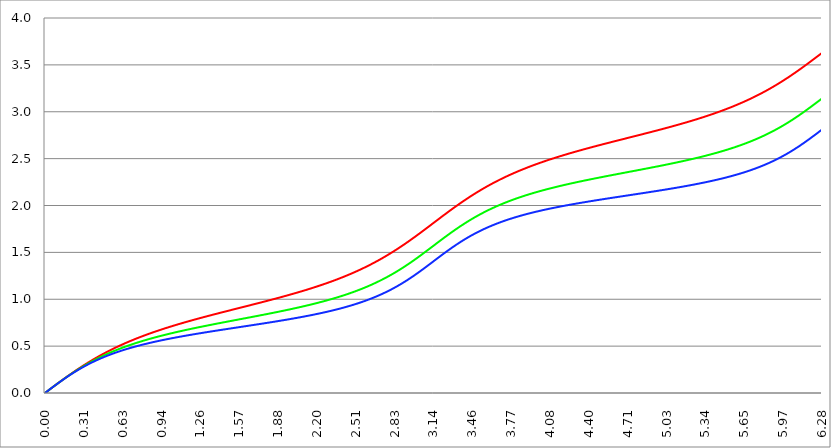
| Category | Series 1 | Series 0 | Series 2 |
|---|---|---|---|
| 0.0 | 0 | 0 | 0 |
| 0.00314159265358979 | 0.003 | 0.003 | 0.003 |
| 0.00628318530717958 | 0.006 | 0.006 | 0.006 |
| 0.00942477796076938 | 0.009 | 0.009 | 0.009 |
| 0.0125663706143592 | 0.013 | 0.013 | 0.013 |
| 0.015707963267949 | 0.016 | 0.016 | 0.016 |
| 0.0188495559215388 | 0.019 | 0.019 | 0.019 |
| 0.0219911485751285 | 0.022 | 0.022 | 0.022 |
| 0.0251327412287183 | 0.025 | 0.025 | 0.025 |
| 0.0282743338823081 | 0.028 | 0.028 | 0.028 |
| 0.0314159265358979 | 0.031 | 0.031 | 0.031 |
| 0.0345575191894877 | 0.035 | 0.035 | 0.035 |
| 0.0376991118430775 | 0.038 | 0.038 | 0.038 |
| 0.0408407044966673 | 0.041 | 0.041 | 0.041 |
| 0.0439822971502571 | 0.044 | 0.044 | 0.044 |
| 0.0471238898038469 | 0.047 | 0.047 | 0.047 |
| 0.0502654824574367 | 0.05 | 0.05 | 0.05 |
| 0.0534070751110265 | 0.053 | 0.053 | 0.053 |
| 0.0565486677646163 | 0.056 | 0.056 | 0.056 |
| 0.059690260418206 | 0.06 | 0.059 | 0.059 |
| 0.0628318530717958 | 0.063 | 0.063 | 0.063 |
| 0.0659734457253856 | 0.066 | 0.066 | 0.066 |
| 0.0691150383789754 | 0.069 | 0.069 | 0.069 |
| 0.0722566310325652 | 0.072 | 0.072 | 0.072 |
| 0.075398223686155 | 0.075 | 0.075 | 0.075 |
| 0.0785398163397448 | 0.078 | 0.078 | 0.078 |
| 0.0816814089933346 | 0.081 | 0.081 | 0.081 |
| 0.0848230016469244 | 0.084 | 0.084 | 0.084 |
| 0.0879645943005142 | 0.088 | 0.087 | 0.087 |
| 0.091106186954104 | 0.091 | 0.09 | 0.09 |
| 0.0942477796076937 | 0.094 | 0.093 | 0.093 |
| 0.0973893722612835 | 0.097 | 0.096 | 0.096 |
| 0.100530964914873 | 0.1 | 0.1 | 0.099 |
| 0.103672557568463 | 0.103 | 0.103 | 0.102 |
| 0.106814150222053 | 0.106 | 0.106 | 0.105 |
| 0.109955742875643 | 0.109 | 0.109 | 0.108 |
| 0.113097335529233 | 0.112 | 0.112 | 0.111 |
| 0.116238928182822 | 0.115 | 0.115 | 0.114 |
| 0.119380520836412 | 0.118 | 0.118 | 0.117 |
| 0.122522113490002 | 0.121 | 0.121 | 0.12 |
| 0.125663706143592 | 0.124 | 0.124 | 0.123 |
| 0.128805298797181 | 0.127 | 0.127 | 0.126 |
| 0.131946891450771 | 0.13 | 0.13 | 0.129 |
| 0.135088484104361 | 0.133 | 0.133 | 0.132 |
| 0.138230076757951 | 0.137 | 0.136 | 0.135 |
| 0.141371669411541 | 0.14 | 0.139 | 0.138 |
| 0.14451326206513 | 0.143 | 0.142 | 0.141 |
| 0.14765485471872 | 0.146 | 0.145 | 0.144 |
| 0.15079644737231 | 0.149 | 0.148 | 0.146 |
| 0.1539380400259 | 0.152 | 0.15 | 0.149 |
| 0.15707963267949 | 0.155 | 0.153 | 0.152 |
| 0.160221225333079 | 0.158 | 0.156 | 0.155 |
| 0.163362817986669 | 0.161 | 0.159 | 0.158 |
| 0.166504410640259 | 0.164 | 0.162 | 0.161 |
| 0.169646003293849 | 0.167 | 0.165 | 0.164 |
| 0.172787595947439 | 0.169 | 0.168 | 0.166 |
| 0.175929188601028 | 0.172 | 0.171 | 0.169 |
| 0.179070781254618 | 0.175 | 0.174 | 0.172 |
| 0.182212373908208 | 0.178 | 0.177 | 0.175 |
| 0.185353966561798 | 0.181 | 0.179 | 0.178 |
| 0.188495559215388 | 0.184 | 0.182 | 0.18 |
| 0.191637151868977 | 0.187 | 0.185 | 0.183 |
| 0.194778744522567 | 0.19 | 0.188 | 0.186 |
| 0.197920337176157 | 0.193 | 0.191 | 0.189 |
| 0.201061929829747 | 0.196 | 0.194 | 0.191 |
| 0.204203522483336 | 0.199 | 0.196 | 0.194 |
| 0.207345115136926 | 0.202 | 0.199 | 0.197 |
| 0.210486707790516 | 0.205 | 0.202 | 0.199 |
| 0.213628300444106 | 0.208 | 0.205 | 0.202 |
| 0.216769893097696 | 0.21 | 0.207 | 0.205 |
| 0.219911485751285 | 0.213 | 0.21 | 0.207 |
| 0.223053078404875 | 0.216 | 0.213 | 0.21 |
| 0.226194671058465 | 0.219 | 0.216 | 0.213 |
| 0.229336263712055 | 0.222 | 0.218 | 0.215 |
| 0.232477856365645 | 0.225 | 0.221 | 0.218 |
| 0.235619449019234 | 0.228 | 0.224 | 0.22 |
| 0.238761041672824 | 0.23 | 0.227 | 0.223 |
| 0.241902634326414 | 0.233 | 0.229 | 0.225 |
| 0.245044226980004 | 0.236 | 0.232 | 0.228 |
| 0.248185819633594 | 0.239 | 0.235 | 0.231 |
| 0.251327412287183 | 0.242 | 0.237 | 0.233 |
| 0.254469004940773 | 0.244 | 0.24 | 0.236 |
| 0.257610597594363 | 0.247 | 0.242 | 0.238 |
| 0.260752190247953 | 0.25 | 0.245 | 0.241 |
| 0.263893782901543 | 0.253 | 0.248 | 0.243 |
| 0.267035375555132 | 0.255 | 0.25 | 0.246 |
| 0.270176968208722 | 0.258 | 0.253 | 0.248 |
| 0.273318560862312 | 0.261 | 0.255 | 0.25 |
| 0.276460153515902 | 0.264 | 0.258 | 0.253 |
| 0.279601746169492 | 0.266 | 0.261 | 0.255 |
| 0.282743338823082 | 0.269 | 0.263 | 0.258 |
| 0.285884931476671 | 0.272 | 0.266 | 0.26 |
| 0.289026524130261 | 0.275 | 0.268 | 0.262 |
| 0.292168116783851 | 0.277 | 0.271 | 0.265 |
| 0.295309709437441 | 0.28 | 0.273 | 0.267 |
| 0.298451302091031 | 0.283 | 0.276 | 0.269 |
| 0.30159289474462 | 0.285 | 0.278 | 0.272 |
| 0.30473448739821 | 0.288 | 0.281 | 0.274 |
| 0.3078760800518 | 0.291 | 0.283 | 0.276 |
| 0.31101767270539 | 0.293 | 0.286 | 0.279 |
| 0.31415926535898 | 0.296 | 0.288 | 0.281 |
| 0.31730085801257 | 0.299 | 0.291 | 0.283 |
| 0.320442450666159 | 0.301 | 0.293 | 0.286 |
| 0.323584043319749 | 0.304 | 0.295 | 0.288 |
| 0.326725635973339 | 0.306 | 0.298 | 0.29 |
| 0.329867228626929 | 0.309 | 0.3 | 0.292 |
| 0.333008821280519 | 0.312 | 0.303 | 0.294 |
| 0.336150413934108 | 0.314 | 0.305 | 0.297 |
| 0.339292006587698 | 0.317 | 0.307 | 0.299 |
| 0.342433599241288 | 0.319 | 0.31 | 0.301 |
| 0.345575191894878 | 0.322 | 0.312 | 0.303 |
| 0.348716784548468 | 0.324 | 0.314 | 0.305 |
| 0.351858377202058 | 0.327 | 0.317 | 0.307 |
| 0.354999969855647 | 0.33 | 0.319 | 0.31 |
| 0.358141562509237 | 0.332 | 0.321 | 0.312 |
| 0.361283155162827 | 0.335 | 0.324 | 0.314 |
| 0.364424747816417 | 0.337 | 0.326 | 0.316 |
| 0.367566340470007 | 0.34 | 0.328 | 0.318 |
| 0.370707933123597 | 0.342 | 0.33 | 0.32 |
| 0.373849525777186 | 0.345 | 0.333 | 0.322 |
| 0.376991118430776 | 0.347 | 0.335 | 0.324 |
| 0.380132711084366 | 0.35 | 0.337 | 0.326 |
| 0.383274303737956 | 0.352 | 0.339 | 0.328 |
| 0.386415896391546 | 0.354 | 0.342 | 0.33 |
| 0.389557489045135 | 0.357 | 0.344 | 0.332 |
| 0.392699081698725 | 0.359 | 0.346 | 0.334 |
| 0.395840674352315 | 0.362 | 0.348 | 0.336 |
| 0.398982267005905 | 0.364 | 0.35 | 0.338 |
| 0.402123859659495 | 0.367 | 0.352 | 0.34 |
| 0.405265452313085 | 0.369 | 0.355 | 0.342 |
| 0.408407044966674 | 0.371 | 0.357 | 0.344 |
| 0.411548637620264 | 0.374 | 0.359 | 0.346 |
| 0.414690230273854 | 0.376 | 0.361 | 0.348 |
| 0.417831822927444 | 0.378 | 0.363 | 0.35 |
| 0.420973415581034 | 0.381 | 0.365 | 0.352 |
| 0.424115008234623 | 0.383 | 0.367 | 0.353 |
| 0.427256600888213 | 0.386 | 0.369 | 0.355 |
| 0.430398193541803 | 0.388 | 0.371 | 0.357 |
| 0.433539786195393 | 0.39 | 0.373 | 0.359 |
| 0.436681378848983 | 0.393 | 0.375 | 0.361 |
| 0.439822971502573 | 0.395 | 0.378 | 0.363 |
| 0.442964564156162 | 0.397 | 0.38 | 0.364 |
| 0.446106156809752 | 0.399 | 0.382 | 0.366 |
| 0.449247749463342 | 0.402 | 0.384 | 0.368 |
| 0.452389342116932 | 0.404 | 0.386 | 0.37 |
| 0.455530934770522 | 0.406 | 0.388 | 0.372 |
| 0.458672527424111 | 0.409 | 0.39 | 0.373 |
| 0.461814120077701 | 0.411 | 0.392 | 0.375 |
| 0.464955712731291 | 0.413 | 0.394 | 0.377 |
| 0.468097305384881 | 0.415 | 0.395 | 0.379 |
| 0.471238898038471 | 0.417 | 0.397 | 0.38 |
| 0.474380490692061 | 0.42 | 0.399 | 0.382 |
| 0.47752208334565 | 0.422 | 0.401 | 0.384 |
| 0.48066367599924 | 0.424 | 0.403 | 0.385 |
| 0.48380526865283 | 0.426 | 0.405 | 0.387 |
| 0.48694686130642 | 0.428 | 0.407 | 0.389 |
| 0.49008845396001 | 0.431 | 0.409 | 0.39 |
| 0.493230046613599 | 0.433 | 0.411 | 0.392 |
| 0.496371639267189 | 0.435 | 0.413 | 0.394 |
| 0.499513231920779 | 0.437 | 0.415 | 0.395 |
| 0.502654824574369 | 0.439 | 0.416 | 0.397 |
| 0.505796417227959 | 0.441 | 0.418 | 0.399 |
| 0.508938009881549 | 0.444 | 0.42 | 0.4 |
| 0.512079602535138 | 0.446 | 0.422 | 0.402 |
| 0.515221195188728 | 0.448 | 0.424 | 0.404 |
| 0.518362787842318 | 0.45 | 0.426 | 0.405 |
| 0.521504380495908 | 0.452 | 0.427 | 0.407 |
| 0.524645973149498 | 0.454 | 0.429 | 0.408 |
| 0.527787565803087 | 0.456 | 0.431 | 0.41 |
| 0.530929158456677 | 0.458 | 0.433 | 0.411 |
| 0.534070751110267 | 0.46 | 0.434 | 0.413 |
| 0.537212343763857 | 0.462 | 0.436 | 0.414 |
| 0.540353936417447 | 0.465 | 0.438 | 0.416 |
| 0.543495529071037 | 0.467 | 0.44 | 0.418 |
| 0.546637121724626 | 0.469 | 0.441 | 0.419 |
| 0.549778714378216 | 0.471 | 0.443 | 0.421 |
| 0.552920307031806 | 0.473 | 0.445 | 0.422 |
| 0.556061899685396 | 0.475 | 0.447 | 0.424 |
| 0.559203492338986 | 0.477 | 0.448 | 0.425 |
| 0.562345084992576 | 0.479 | 0.45 | 0.426 |
| 0.565486677646165 | 0.481 | 0.452 | 0.428 |
| 0.568628270299755 | 0.483 | 0.453 | 0.429 |
| 0.571769862953345 | 0.485 | 0.455 | 0.431 |
| 0.574911455606935 | 0.487 | 0.457 | 0.432 |
| 0.578053048260525 | 0.489 | 0.458 | 0.434 |
| 0.581194640914114 | 0.491 | 0.46 | 0.435 |
| 0.584336233567704 | 0.493 | 0.462 | 0.437 |
| 0.587477826221294 | 0.495 | 0.463 | 0.438 |
| 0.590619418874884 | 0.496 | 0.465 | 0.439 |
| 0.593761011528474 | 0.498 | 0.467 | 0.441 |
| 0.596902604182064 | 0.5 | 0.468 | 0.442 |
| 0.600044196835653 | 0.502 | 0.47 | 0.444 |
| 0.603185789489243 | 0.504 | 0.471 | 0.445 |
| 0.606327382142833 | 0.506 | 0.473 | 0.446 |
| 0.609468974796423 | 0.508 | 0.475 | 0.448 |
| 0.612610567450013 | 0.51 | 0.476 | 0.449 |
| 0.615752160103602 | 0.512 | 0.478 | 0.45 |
| 0.618893752757192 | 0.514 | 0.479 | 0.452 |
| 0.622035345410782 | 0.515 | 0.481 | 0.453 |
| 0.625176938064372 | 0.517 | 0.482 | 0.454 |
| 0.628318530717962 | 0.519 | 0.484 | 0.456 |
| 0.631460123371551 | 0.521 | 0.486 | 0.457 |
| 0.634601716025141 | 0.523 | 0.487 | 0.458 |
| 0.637743308678731 | 0.525 | 0.489 | 0.46 |
| 0.640884901332321 | 0.527 | 0.49 | 0.461 |
| 0.644026493985911 | 0.528 | 0.492 | 0.462 |
| 0.647168086639501 | 0.53 | 0.493 | 0.464 |
| 0.65030967929309 | 0.532 | 0.495 | 0.465 |
| 0.65345127194668 | 0.534 | 0.496 | 0.466 |
| 0.65659286460027 | 0.536 | 0.498 | 0.467 |
| 0.65973445725386 | 0.537 | 0.499 | 0.469 |
| 0.66287604990745 | 0.539 | 0.501 | 0.47 |
| 0.666017642561039 | 0.541 | 0.502 | 0.471 |
| 0.669159235214629 | 0.543 | 0.504 | 0.472 |
| 0.672300827868219 | 0.545 | 0.505 | 0.474 |
| 0.675442420521809 | 0.546 | 0.506 | 0.475 |
| 0.678584013175399 | 0.548 | 0.508 | 0.476 |
| 0.681725605828989 | 0.55 | 0.509 | 0.477 |
| 0.684867198482578 | 0.552 | 0.511 | 0.478 |
| 0.688008791136168 | 0.553 | 0.512 | 0.48 |
| 0.691150383789758 | 0.555 | 0.514 | 0.481 |
| 0.694291976443348 | 0.557 | 0.515 | 0.482 |
| 0.697433569096938 | 0.559 | 0.516 | 0.483 |
| 0.700575161750528 | 0.56 | 0.518 | 0.484 |
| 0.703716754404117 | 0.562 | 0.519 | 0.486 |
| 0.706858347057707 | 0.564 | 0.521 | 0.487 |
| 0.709999939711297 | 0.565 | 0.522 | 0.488 |
| 0.713141532364887 | 0.567 | 0.523 | 0.489 |
| 0.716283125018477 | 0.569 | 0.525 | 0.49 |
| 0.719424717672066 | 0.57 | 0.526 | 0.491 |
| 0.722566310325656 | 0.572 | 0.527 | 0.493 |
| 0.725707902979246 | 0.574 | 0.529 | 0.494 |
| 0.728849495632836 | 0.575 | 0.53 | 0.495 |
| 0.731991088286426 | 0.577 | 0.531 | 0.496 |
| 0.735132680940016 | 0.579 | 0.533 | 0.497 |
| 0.738274273593605 | 0.58 | 0.534 | 0.498 |
| 0.741415866247195 | 0.582 | 0.536 | 0.499 |
| 0.744557458900785 | 0.584 | 0.537 | 0.5 |
| 0.747699051554375 | 0.585 | 0.538 | 0.502 |
| 0.750840644207965 | 0.587 | 0.539 | 0.503 |
| 0.753982236861554 | 0.589 | 0.541 | 0.504 |
| 0.757123829515144 | 0.59 | 0.542 | 0.505 |
| 0.760265422168734 | 0.592 | 0.543 | 0.506 |
| 0.763407014822324 | 0.593 | 0.545 | 0.507 |
| 0.766548607475914 | 0.595 | 0.546 | 0.508 |
| 0.769690200129504 | 0.597 | 0.547 | 0.509 |
| 0.772831792783093 | 0.598 | 0.549 | 0.51 |
| 0.775973385436683 | 0.6 | 0.55 | 0.511 |
| 0.779114978090273 | 0.601 | 0.551 | 0.512 |
| 0.782256570743863 | 0.603 | 0.552 | 0.513 |
| 0.785398163397453 | 0.605 | 0.554 | 0.514 |
| 0.788539756051042 | 0.606 | 0.555 | 0.515 |
| 0.791681348704632 | 0.608 | 0.556 | 0.516 |
| 0.794822941358222 | 0.609 | 0.557 | 0.518 |
| 0.797964534011812 | 0.611 | 0.559 | 0.519 |
| 0.801106126665402 | 0.612 | 0.56 | 0.52 |
| 0.804247719318992 | 0.614 | 0.561 | 0.521 |
| 0.807389311972581 | 0.615 | 0.562 | 0.522 |
| 0.810530904626171 | 0.617 | 0.563 | 0.523 |
| 0.813672497279761 | 0.619 | 0.565 | 0.524 |
| 0.816814089933351 | 0.62 | 0.566 | 0.525 |
| 0.819955682586941 | 0.622 | 0.567 | 0.526 |
| 0.823097275240531 | 0.623 | 0.568 | 0.527 |
| 0.82623886789412 | 0.625 | 0.57 | 0.528 |
| 0.82938046054771 | 0.626 | 0.571 | 0.529 |
| 0.8325220532013 | 0.628 | 0.572 | 0.53 |
| 0.83566364585489 | 0.629 | 0.573 | 0.531 |
| 0.83880523850848 | 0.631 | 0.574 | 0.532 |
| 0.841946831162069 | 0.632 | 0.575 | 0.533 |
| 0.845088423815659 | 0.634 | 0.577 | 0.534 |
| 0.848230016469249 | 0.635 | 0.578 | 0.535 |
| 0.851371609122839 | 0.637 | 0.579 | 0.535 |
| 0.854513201776429 | 0.638 | 0.58 | 0.536 |
| 0.857654794430019 | 0.639 | 0.581 | 0.537 |
| 0.860796387083608 | 0.641 | 0.582 | 0.538 |
| 0.863937979737198 | 0.642 | 0.584 | 0.539 |
| 0.867079572390788 | 0.644 | 0.585 | 0.54 |
| 0.870221165044378 | 0.645 | 0.586 | 0.541 |
| 0.873362757697968 | 0.647 | 0.587 | 0.542 |
| 0.876504350351557 | 0.648 | 0.588 | 0.543 |
| 0.879645943005147 | 0.65 | 0.589 | 0.544 |
| 0.882787535658737 | 0.651 | 0.59 | 0.545 |
| 0.885929128312327 | 0.653 | 0.592 | 0.546 |
| 0.889070720965917 | 0.654 | 0.593 | 0.547 |
| 0.892212313619507 | 0.655 | 0.594 | 0.548 |
| 0.895353906273096 | 0.657 | 0.595 | 0.549 |
| 0.898495498926686 | 0.658 | 0.596 | 0.55 |
| 0.901637091580276 | 0.66 | 0.597 | 0.55 |
| 0.904778684233866 | 0.661 | 0.598 | 0.551 |
| 0.907920276887456 | 0.662 | 0.599 | 0.552 |
| 0.911061869541045 | 0.664 | 0.6 | 0.553 |
| 0.914203462194635 | 0.665 | 0.602 | 0.554 |
| 0.917345054848225 | 0.667 | 0.603 | 0.555 |
| 0.920486647501815 | 0.668 | 0.604 | 0.556 |
| 0.923628240155405 | 0.669 | 0.605 | 0.557 |
| 0.926769832808995 | 0.671 | 0.606 | 0.558 |
| 0.929911425462584 | 0.672 | 0.607 | 0.558 |
| 0.933053018116174 | 0.673 | 0.608 | 0.559 |
| 0.936194610769764 | 0.675 | 0.609 | 0.56 |
| 0.939336203423354 | 0.676 | 0.61 | 0.561 |
| 0.942477796076944 | 0.678 | 0.611 | 0.562 |
| 0.945619388730533 | 0.679 | 0.612 | 0.563 |
| 0.948760981384123 | 0.68 | 0.613 | 0.564 |
| 0.951902574037713 | 0.682 | 0.614 | 0.565 |
| 0.955044166691303 | 0.683 | 0.615 | 0.565 |
| 0.958185759344893 | 0.684 | 0.616 | 0.566 |
| 0.961327351998483 | 0.686 | 0.617 | 0.567 |
| 0.964468944652072 | 0.687 | 0.619 | 0.568 |
| 0.967610537305662 | 0.688 | 0.62 | 0.569 |
| 0.970752129959252 | 0.69 | 0.621 | 0.57 |
| 0.973893722612842 | 0.691 | 0.622 | 0.571 |
| 0.977035315266432 | 0.692 | 0.623 | 0.571 |
| 0.980176907920022 | 0.694 | 0.624 | 0.572 |
| 0.983318500573611 | 0.695 | 0.625 | 0.573 |
| 0.986460093227201 | 0.696 | 0.626 | 0.574 |
| 0.989601685880791 | 0.698 | 0.627 | 0.575 |
| 0.992743278534381 | 0.699 | 0.628 | 0.576 |
| 0.995884871187971 | 0.7 | 0.629 | 0.576 |
| 0.99902646384156 | 0.702 | 0.63 | 0.577 |
| 1.00216805649515 | 0.703 | 0.631 | 0.578 |
| 1.00530964914874 | 0.704 | 0.632 | 0.579 |
| 1.00845124180233 | 0.705 | 0.633 | 0.58 |
| 1.01159283445592 | 0.707 | 0.634 | 0.58 |
| 1.01473442710951 | 0.708 | 0.635 | 0.581 |
| 1.017876019763099 | 0.709 | 0.636 | 0.582 |
| 1.021017612416689 | 0.711 | 0.637 | 0.583 |
| 1.02415920507028 | 0.712 | 0.638 | 0.584 |
| 1.027300797723869 | 0.713 | 0.639 | 0.584 |
| 1.030442390377459 | 0.714 | 0.64 | 0.585 |
| 1.033583983031048 | 0.716 | 0.641 | 0.586 |
| 1.036725575684638 | 0.717 | 0.642 | 0.587 |
| 1.039867168338228 | 0.718 | 0.643 | 0.588 |
| 1.043008760991818 | 0.719 | 0.644 | 0.588 |
| 1.046150353645408 | 0.721 | 0.645 | 0.589 |
| 1.049291946298998 | 0.722 | 0.646 | 0.59 |
| 1.052433538952587 | 0.723 | 0.646 | 0.591 |
| 1.055575131606177 | 0.724 | 0.647 | 0.592 |
| 1.058716724259767 | 0.726 | 0.648 | 0.592 |
| 1.061858316913357 | 0.727 | 0.649 | 0.593 |
| 1.064999909566947 | 0.728 | 0.65 | 0.594 |
| 1.068141502220536 | 0.729 | 0.651 | 0.595 |
| 1.071283094874126 | 0.731 | 0.652 | 0.595 |
| 1.074424687527716 | 0.732 | 0.653 | 0.596 |
| 1.077566280181306 | 0.733 | 0.654 | 0.597 |
| 1.080707872834896 | 0.734 | 0.655 | 0.598 |
| 1.083849465488486 | 0.736 | 0.656 | 0.599 |
| 1.086991058142075 | 0.737 | 0.657 | 0.599 |
| 1.090132650795665 | 0.738 | 0.658 | 0.6 |
| 1.093274243449255 | 0.739 | 0.659 | 0.601 |
| 1.096415836102845 | 0.741 | 0.66 | 0.602 |
| 1.099557428756435 | 0.742 | 0.661 | 0.602 |
| 1.102699021410025 | 0.743 | 0.662 | 0.603 |
| 1.105840614063614 | 0.744 | 0.663 | 0.604 |
| 1.108982206717204 | 0.745 | 0.663 | 0.605 |
| 1.112123799370794 | 0.747 | 0.664 | 0.605 |
| 1.115265392024384 | 0.748 | 0.665 | 0.606 |
| 1.118406984677974 | 0.749 | 0.666 | 0.607 |
| 1.121548577331563 | 0.75 | 0.667 | 0.608 |
| 1.124690169985153 | 0.751 | 0.668 | 0.608 |
| 1.127831762638743 | 0.753 | 0.669 | 0.609 |
| 1.130973355292333 | 0.754 | 0.67 | 0.61 |
| 1.134114947945923 | 0.755 | 0.671 | 0.61 |
| 1.137256540599513 | 0.756 | 0.672 | 0.611 |
| 1.140398133253102 | 0.757 | 0.673 | 0.612 |
| 1.143539725906692 | 0.758 | 0.673 | 0.613 |
| 1.146681318560282 | 0.76 | 0.674 | 0.613 |
| 1.149822911213872 | 0.761 | 0.675 | 0.614 |
| 1.152964503867462 | 0.762 | 0.676 | 0.615 |
| 1.156106096521051 | 0.763 | 0.677 | 0.616 |
| 1.159247689174641 | 0.764 | 0.678 | 0.616 |
| 1.162389281828231 | 0.766 | 0.679 | 0.617 |
| 1.165530874481821 | 0.767 | 0.68 | 0.618 |
| 1.168672467135411 | 0.768 | 0.681 | 0.618 |
| 1.171814059789001 | 0.769 | 0.682 | 0.619 |
| 1.17495565244259 | 0.77 | 0.682 | 0.62 |
| 1.17809724509618 | 0.771 | 0.683 | 0.621 |
| 1.18123883774977 | 0.773 | 0.684 | 0.621 |
| 1.18438043040336 | 0.774 | 0.685 | 0.622 |
| 1.18752202305695 | 0.775 | 0.686 | 0.623 |
| 1.190663615710539 | 0.776 | 0.687 | 0.623 |
| 1.193805208364129 | 0.777 | 0.688 | 0.624 |
| 1.19694680101772 | 0.778 | 0.689 | 0.625 |
| 1.200088393671309 | 0.779 | 0.689 | 0.626 |
| 1.203229986324899 | 0.781 | 0.69 | 0.626 |
| 1.206371578978489 | 0.782 | 0.691 | 0.627 |
| 1.209513171632078 | 0.783 | 0.692 | 0.628 |
| 1.212654764285668 | 0.784 | 0.693 | 0.628 |
| 1.215796356939258 | 0.785 | 0.694 | 0.629 |
| 1.218937949592848 | 0.786 | 0.695 | 0.63 |
| 1.222079542246438 | 0.787 | 0.695 | 0.63 |
| 1.225221134900027 | 0.789 | 0.696 | 0.631 |
| 1.228362727553617 | 0.79 | 0.697 | 0.632 |
| 1.231504320207207 | 0.791 | 0.698 | 0.632 |
| 1.234645912860797 | 0.792 | 0.699 | 0.633 |
| 1.237787505514387 | 0.793 | 0.7 | 0.634 |
| 1.240929098167977 | 0.794 | 0.701 | 0.635 |
| 1.244070690821566 | 0.795 | 0.701 | 0.635 |
| 1.247212283475156 | 0.796 | 0.702 | 0.636 |
| 1.250353876128746 | 0.798 | 0.703 | 0.637 |
| 1.253495468782336 | 0.799 | 0.704 | 0.637 |
| 1.256637061435926 | 0.8 | 0.705 | 0.638 |
| 1.259778654089515 | 0.801 | 0.706 | 0.639 |
| 1.262920246743105 | 0.802 | 0.707 | 0.639 |
| 1.266061839396695 | 0.803 | 0.707 | 0.64 |
| 1.269203432050285 | 0.804 | 0.708 | 0.641 |
| 1.272345024703875 | 0.805 | 0.709 | 0.641 |
| 1.275486617357465 | 0.807 | 0.71 | 0.642 |
| 1.278628210011054 | 0.808 | 0.711 | 0.643 |
| 1.281769802664644 | 0.809 | 0.712 | 0.643 |
| 1.284911395318234 | 0.81 | 0.712 | 0.644 |
| 1.288052987971824 | 0.811 | 0.713 | 0.645 |
| 1.291194580625414 | 0.812 | 0.714 | 0.645 |
| 1.294336173279003 | 0.813 | 0.715 | 0.646 |
| 1.297477765932593 | 0.814 | 0.716 | 0.647 |
| 1.300619358586183 | 0.815 | 0.717 | 0.647 |
| 1.303760951239773 | 0.816 | 0.717 | 0.648 |
| 1.306902543893363 | 0.818 | 0.718 | 0.649 |
| 1.310044136546953 | 0.819 | 0.719 | 0.649 |
| 1.313185729200542 | 0.82 | 0.72 | 0.65 |
| 1.316327321854132 | 0.821 | 0.721 | 0.651 |
| 1.319468914507722 | 0.822 | 0.722 | 0.651 |
| 1.322610507161312 | 0.823 | 0.722 | 0.652 |
| 1.325752099814902 | 0.824 | 0.723 | 0.653 |
| 1.328893692468491 | 0.825 | 0.724 | 0.653 |
| 1.332035285122081 | 0.826 | 0.725 | 0.654 |
| 1.335176877775671 | 0.827 | 0.726 | 0.655 |
| 1.338318470429261 | 0.828 | 0.726 | 0.655 |
| 1.341460063082851 | 0.83 | 0.727 | 0.656 |
| 1.344601655736441 | 0.831 | 0.728 | 0.657 |
| 1.34774324839003 | 0.832 | 0.729 | 0.657 |
| 1.35088484104362 | 0.833 | 0.73 | 0.658 |
| 1.35402643369721 | 0.834 | 0.731 | 0.659 |
| 1.3571680263508 | 0.835 | 0.731 | 0.659 |
| 1.36030961900439 | 0.836 | 0.732 | 0.66 |
| 1.363451211657979 | 0.837 | 0.733 | 0.661 |
| 1.36659280431157 | 0.838 | 0.734 | 0.661 |
| 1.369734396965159 | 0.839 | 0.735 | 0.662 |
| 1.372875989618749 | 0.84 | 0.735 | 0.662 |
| 1.376017582272339 | 0.841 | 0.736 | 0.663 |
| 1.379159174925929 | 0.842 | 0.737 | 0.664 |
| 1.382300767579518 | 0.844 | 0.738 | 0.664 |
| 1.385442360233108 | 0.845 | 0.739 | 0.665 |
| 1.388583952886698 | 0.846 | 0.739 | 0.666 |
| 1.391725545540288 | 0.847 | 0.74 | 0.666 |
| 1.394867138193878 | 0.848 | 0.741 | 0.667 |
| 1.398008730847468 | 0.849 | 0.742 | 0.668 |
| 1.401150323501057 | 0.85 | 0.743 | 0.668 |
| 1.404291916154647 | 0.851 | 0.743 | 0.669 |
| 1.407433508808237 | 0.852 | 0.744 | 0.67 |
| 1.410575101461827 | 0.853 | 0.745 | 0.67 |
| 1.413716694115417 | 0.854 | 0.746 | 0.671 |
| 1.416858286769006 | 0.855 | 0.747 | 0.671 |
| 1.419999879422596 | 0.856 | 0.747 | 0.672 |
| 1.423141472076186 | 0.857 | 0.748 | 0.673 |
| 1.426283064729776 | 0.859 | 0.749 | 0.673 |
| 1.429424657383366 | 0.86 | 0.75 | 0.674 |
| 1.432566250036956 | 0.861 | 0.751 | 0.675 |
| 1.435707842690545 | 0.862 | 0.751 | 0.675 |
| 1.438849435344135 | 0.863 | 0.752 | 0.676 |
| 1.441991027997725 | 0.864 | 0.753 | 0.677 |
| 1.445132620651315 | 0.865 | 0.754 | 0.677 |
| 1.448274213304905 | 0.866 | 0.755 | 0.678 |
| 1.451415805958494 | 0.867 | 0.755 | 0.679 |
| 1.454557398612084 | 0.868 | 0.756 | 0.679 |
| 1.457698991265674 | 0.869 | 0.757 | 0.68 |
| 1.460840583919264 | 0.87 | 0.758 | 0.68 |
| 1.463982176572854 | 0.871 | 0.759 | 0.681 |
| 1.467123769226444 | 0.872 | 0.759 | 0.682 |
| 1.470265361880033 | 0.873 | 0.76 | 0.682 |
| 1.473406954533623 | 0.874 | 0.761 | 0.683 |
| 1.476548547187213 | 0.875 | 0.762 | 0.684 |
| 1.479690139840803 | 0.876 | 0.763 | 0.684 |
| 1.482831732494393 | 0.878 | 0.763 | 0.685 |
| 1.485973325147982 | 0.879 | 0.764 | 0.685 |
| 1.489114917801572 | 0.88 | 0.765 | 0.686 |
| 1.492256510455162 | 0.881 | 0.766 | 0.687 |
| 1.495398103108752 | 0.882 | 0.767 | 0.687 |
| 1.498539695762342 | 0.883 | 0.767 | 0.688 |
| 1.501681288415932 | 0.884 | 0.768 | 0.689 |
| 1.504822881069521 | 0.885 | 0.769 | 0.689 |
| 1.507964473723111 | 0.886 | 0.77 | 0.69 |
| 1.511106066376701 | 0.887 | 0.77 | 0.691 |
| 1.514247659030291 | 0.888 | 0.771 | 0.691 |
| 1.517389251683881 | 0.889 | 0.772 | 0.692 |
| 1.520530844337471 | 0.89 | 0.773 | 0.692 |
| 1.52367243699106 | 0.891 | 0.774 | 0.693 |
| 1.52681402964465 | 0.892 | 0.774 | 0.694 |
| 1.52995562229824 | 0.893 | 0.775 | 0.694 |
| 1.53309721495183 | 0.894 | 0.776 | 0.695 |
| 1.53623880760542 | 0.895 | 0.777 | 0.696 |
| 1.539380400259009 | 0.896 | 0.778 | 0.696 |
| 1.542521992912599 | 0.897 | 0.778 | 0.697 |
| 1.545663585566189 | 0.899 | 0.779 | 0.697 |
| 1.548805178219779 | 0.9 | 0.78 | 0.698 |
| 1.551946770873369 | 0.901 | 0.781 | 0.699 |
| 1.555088363526959 | 0.902 | 0.781 | 0.699 |
| 1.558229956180548 | 0.903 | 0.782 | 0.7 |
| 1.561371548834138 | 0.904 | 0.783 | 0.701 |
| 1.564513141487728 | 0.905 | 0.784 | 0.701 |
| 1.567654734141318 | 0.906 | 0.785 | 0.702 |
| 1.570796326794908 | 0.907 | 0.785 | 0.702 |
| 1.573937919448497 | 0.908 | 0.786 | 0.703 |
| 1.577079512102087 | 0.909 | 0.787 | 0.704 |
| 1.580221104755677 | 0.91 | 0.788 | 0.704 |
| 1.583362697409267 | 0.911 | 0.789 | 0.705 |
| 1.586504290062857 | 0.912 | 0.789 | 0.706 |
| 1.589645882716447 | 0.913 | 0.79 | 0.706 |
| 1.592787475370036 | 0.914 | 0.791 | 0.707 |
| 1.595929068023626 | 0.915 | 0.792 | 0.708 |
| 1.599070660677216 | 0.916 | 0.792 | 0.708 |
| 1.602212253330806 | 0.917 | 0.793 | 0.709 |
| 1.605353845984396 | 0.918 | 0.794 | 0.709 |
| 1.608495438637985 | 0.919 | 0.795 | 0.71 |
| 1.611637031291575 | 0.921 | 0.796 | 0.711 |
| 1.614778623945165 | 0.922 | 0.796 | 0.711 |
| 1.617920216598755 | 0.923 | 0.797 | 0.712 |
| 1.621061809252345 | 0.924 | 0.798 | 0.713 |
| 1.624203401905935 | 0.925 | 0.799 | 0.713 |
| 1.627344994559524 | 0.926 | 0.8 | 0.714 |
| 1.630486587213114 | 0.927 | 0.8 | 0.714 |
| 1.633628179866704 | 0.928 | 0.801 | 0.715 |
| 1.636769772520294 | 0.929 | 0.802 | 0.716 |
| 1.639911365173884 | 0.93 | 0.803 | 0.716 |
| 1.643052957827473 | 0.931 | 0.803 | 0.717 |
| 1.646194550481063 | 0.932 | 0.804 | 0.718 |
| 1.649336143134653 | 0.933 | 0.805 | 0.718 |
| 1.652477735788243 | 0.934 | 0.806 | 0.719 |
| 1.655619328441833 | 0.935 | 0.807 | 0.719 |
| 1.658760921095423 | 0.936 | 0.807 | 0.72 |
| 1.661902513749012 | 0.937 | 0.808 | 0.721 |
| 1.665044106402602 | 0.938 | 0.809 | 0.721 |
| 1.668185699056192 | 0.939 | 0.81 | 0.722 |
| 1.671327291709782 | 0.94 | 0.811 | 0.723 |
| 1.674468884363372 | 0.942 | 0.811 | 0.723 |
| 1.677610477016961 | 0.943 | 0.812 | 0.724 |
| 1.680752069670551 | 0.944 | 0.813 | 0.725 |
| 1.683893662324141 | 0.945 | 0.814 | 0.725 |
| 1.687035254977731 | 0.946 | 0.815 | 0.726 |
| 1.690176847631321 | 0.947 | 0.815 | 0.726 |
| 1.693318440284911 | 0.948 | 0.816 | 0.727 |
| 1.6964600329385 | 0.949 | 0.817 | 0.728 |
| 1.69960162559209 | 0.95 | 0.818 | 0.728 |
| 1.70274321824568 | 0.951 | 0.819 | 0.729 |
| 1.70588481089927 | 0.952 | 0.819 | 0.73 |
| 1.70902640355286 | 0.953 | 0.82 | 0.73 |
| 1.712167996206449 | 0.954 | 0.821 | 0.731 |
| 1.715309588860039 | 0.955 | 0.822 | 0.732 |
| 1.71845118151363 | 0.956 | 0.823 | 0.732 |
| 1.721592774167219 | 0.957 | 0.823 | 0.733 |
| 1.724734366820809 | 0.958 | 0.824 | 0.733 |
| 1.727875959474399 | 0.96 | 0.825 | 0.734 |
| 1.731017552127988 | 0.961 | 0.826 | 0.735 |
| 1.734159144781578 | 0.962 | 0.827 | 0.735 |
| 1.737300737435168 | 0.963 | 0.827 | 0.736 |
| 1.740442330088758 | 0.964 | 0.828 | 0.737 |
| 1.743583922742348 | 0.965 | 0.829 | 0.737 |
| 1.746725515395937 | 0.966 | 0.83 | 0.738 |
| 1.749867108049527 | 0.967 | 0.831 | 0.739 |
| 1.753008700703117 | 0.968 | 0.831 | 0.739 |
| 1.756150293356707 | 0.969 | 0.832 | 0.74 |
| 1.759291886010297 | 0.97 | 0.833 | 0.741 |
| 1.762433478663887 | 0.971 | 0.834 | 0.741 |
| 1.765575071317476 | 0.972 | 0.835 | 0.742 |
| 1.768716663971066 | 0.973 | 0.835 | 0.742 |
| 1.771858256624656 | 0.975 | 0.836 | 0.743 |
| 1.774999849278246 | 0.976 | 0.837 | 0.744 |
| 1.778141441931836 | 0.977 | 0.838 | 0.744 |
| 1.781283034585426 | 0.978 | 0.839 | 0.745 |
| 1.784424627239015 | 0.979 | 0.839 | 0.746 |
| 1.787566219892605 | 0.98 | 0.84 | 0.746 |
| 1.790707812546195 | 0.981 | 0.841 | 0.747 |
| 1.793849405199785 | 0.982 | 0.842 | 0.748 |
| 1.796990997853375 | 0.983 | 0.843 | 0.748 |
| 1.800132590506964 | 0.984 | 0.843 | 0.749 |
| 1.803274183160554 | 0.985 | 0.844 | 0.75 |
| 1.806415775814144 | 0.986 | 0.845 | 0.75 |
| 1.809557368467734 | 0.988 | 0.846 | 0.751 |
| 1.812698961121324 | 0.989 | 0.847 | 0.752 |
| 1.815840553774914 | 0.99 | 0.848 | 0.752 |
| 1.818982146428503 | 0.991 | 0.848 | 0.753 |
| 1.822123739082093 | 0.992 | 0.849 | 0.754 |
| 1.825265331735683 | 0.993 | 0.85 | 0.754 |
| 1.828406924389273 | 0.994 | 0.851 | 0.755 |
| 1.831548517042863 | 0.995 | 0.852 | 0.756 |
| 1.834690109696452 | 0.996 | 0.853 | 0.756 |
| 1.837831702350042 | 0.997 | 0.853 | 0.757 |
| 1.840973295003632 | 0.998 | 0.854 | 0.758 |
| 1.844114887657222 | 1 | 0.855 | 0.758 |
| 1.847256480310812 | 1.001 | 0.856 | 0.759 |
| 1.850398072964402 | 1.002 | 0.857 | 0.76 |
| 1.853539665617991 | 1.003 | 0.858 | 0.76 |
| 1.856681258271581 | 1.004 | 0.858 | 0.761 |
| 1.859822850925171 | 1.005 | 0.859 | 0.762 |
| 1.862964443578761 | 1.006 | 0.86 | 0.762 |
| 1.866106036232351 | 1.007 | 0.861 | 0.763 |
| 1.86924762888594 | 1.008 | 0.862 | 0.764 |
| 1.87238922153953 | 1.009 | 0.863 | 0.764 |
| 1.87553081419312 | 1.011 | 0.863 | 0.765 |
| 1.87867240684671 | 1.012 | 0.864 | 0.766 |
| 1.8818139995003 | 1.013 | 0.865 | 0.766 |
| 1.88495559215389 | 1.014 | 0.866 | 0.767 |
| 1.888097184807479 | 1.015 | 0.867 | 0.768 |
| 1.891238777461069 | 1.016 | 0.868 | 0.768 |
| 1.89438037011466 | 1.017 | 0.868 | 0.769 |
| 1.897521962768249 | 1.018 | 0.869 | 0.77 |
| 1.900663555421839 | 1.02 | 0.87 | 0.77 |
| 1.903805148075429 | 1.021 | 0.871 | 0.771 |
| 1.906946740729018 | 1.022 | 0.872 | 0.772 |
| 1.910088333382608 | 1.023 | 0.873 | 0.772 |
| 1.913229926036198 | 1.024 | 0.874 | 0.773 |
| 1.916371518689788 | 1.025 | 0.874 | 0.774 |
| 1.919513111343378 | 1.026 | 0.875 | 0.775 |
| 1.922654703996967 | 1.027 | 0.876 | 0.775 |
| 1.925796296650557 | 1.029 | 0.877 | 0.776 |
| 1.928937889304147 | 1.03 | 0.878 | 0.777 |
| 1.932079481957737 | 1.031 | 0.879 | 0.777 |
| 1.935221074611327 | 1.032 | 0.88 | 0.778 |
| 1.938362667264917 | 1.033 | 0.881 | 0.779 |
| 1.941504259918506 | 1.034 | 0.881 | 0.779 |
| 1.944645852572096 | 1.035 | 0.882 | 0.78 |
| 1.947787445225686 | 1.037 | 0.883 | 0.781 |
| 1.950929037879276 | 1.038 | 0.884 | 0.782 |
| 1.954070630532866 | 1.039 | 0.885 | 0.782 |
| 1.957212223186455 | 1.04 | 0.886 | 0.783 |
| 1.960353815840045 | 1.041 | 0.887 | 0.784 |
| 1.963495408493635 | 1.042 | 0.888 | 0.784 |
| 1.966637001147225 | 1.044 | 0.888 | 0.785 |
| 1.969778593800815 | 1.045 | 0.889 | 0.786 |
| 1.972920186454405 | 1.046 | 0.89 | 0.787 |
| 1.976061779107994 | 1.047 | 0.891 | 0.787 |
| 1.979203371761584 | 1.048 | 0.892 | 0.788 |
| 1.982344964415174 | 1.049 | 0.893 | 0.789 |
| 1.985486557068764 | 1.051 | 0.894 | 0.789 |
| 1.988628149722354 | 1.052 | 0.895 | 0.79 |
| 1.991769742375943 | 1.053 | 0.896 | 0.791 |
| 1.994911335029533 | 1.054 | 0.896 | 0.792 |
| 1.998052927683123 | 1.055 | 0.897 | 0.792 |
| 2.001194520336712 | 1.056 | 0.898 | 0.793 |
| 2.004336112990302 | 1.058 | 0.899 | 0.794 |
| 2.007477705643892 | 1.059 | 0.9 | 0.795 |
| 2.010619298297482 | 1.06 | 0.901 | 0.795 |
| 2.013760890951071 | 1.061 | 0.902 | 0.796 |
| 2.016902483604661 | 1.062 | 0.903 | 0.797 |
| 2.02004407625825 | 1.064 | 0.904 | 0.797 |
| 2.02318566891184 | 1.065 | 0.905 | 0.798 |
| 2.02632726156543 | 1.066 | 0.906 | 0.799 |
| 2.029468854219019 | 1.067 | 0.906 | 0.8 |
| 2.032610446872609 | 1.068 | 0.907 | 0.8 |
| 2.035752039526198 | 1.07 | 0.908 | 0.801 |
| 2.038893632179788 | 1.071 | 0.909 | 0.802 |
| 2.042035224833378 | 1.072 | 0.91 | 0.803 |
| 2.045176817486967 | 1.073 | 0.911 | 0.803 |
| 2.048318410140557 | 1.075 | 0.912 | 0.804 |
| 2.051460002794146 | 1.076 | 0.913 | 0.805 |
| 2.054601595447736 | 1.077 | 0.914 | 0.806 |
| 2.057743188101325 | 1.078 | 0.915 | 0.806 |
| 2.060884780754915 | 1.079 | 0.916 | 0.807 |
| 2.064026373408505 | 1.081 | 0.917 | 0.808 |
| 2.067167966062094 | 1.082 | 0.918 | 0.809 |
| 2.070309558715684 | 1.083 | 0.919 | 0.81 |
| 2.073451151369273 | 1.084 | 0.92 | 0.81 |
| 2.076592744022863 | 1.086 | 0.92 | 0.811 |
| 2.079734336676452 | 1.087 | 0.921 | 0.812 |
| 2.082875929330042 | 1.088 | 0.922 | 0.813 |
| 2.086017521983632 | 1.089 | 0.923 | 0.813 |
| 2.089159114637221 | 1.091 | 0.924 | 0.814 |
| 2.092300707290811 | 1.092 | 0.925 | 0.815 |
| 2.095442299944401 | 1.093 | 0.926 | 0.816 |
| 2.09858389259799 | 1.094 | 0.927 | 0.817 |
| 2.10172548525158 | 1.096 | 0.928 | 0.817 |
| 2.104867077905169 | 1.097 | 0.929 | 0.818 |
| 2.108008670558759 | 1.098 | 0.93 | 0.819 |
| 2.111150263212349 | 1.099 | 0.931 | 0.82 |
| 2.114291855865938 | 1.101 | 0.932 | 0.821 |
| 2.117433448519528 | 1.102 | 0.933 | 0.821 |
| 2.120575041173117 | 1.103 | 0.934 | 0.822 |
| 2.123716633826707 | 1.105 | 0.935 | 0.823 |
| 2.126858226480297 | 1.106 | 0.936 | 0.824 |
| 2.129999819133886 | 1.107 | 0.937 | 0.825 |
| 2.133141411787476 | 1.108 | 0.938 | 0.825 |
| 2.136283004441065 | 1.11 | 0.939 | 0.826 |
| 2.139424597094655 | 1.111 | 0.94 | 0.827 |
| 2.142566189748245 | 1.112 | 0.941 | 0.828 |
| 2.145707782401834 | 1.114 | 0.942 | 0.829 |
| 2.148849375055424 | 1.115 | 0.943 | 0.829 |
| 2.151990967709013 | 1.116 | 0.944 | 0.83 |
| 2.155132560362603 | 1.117 | 0.945 | 0.831 |
| 2.158274153016193 | 1.119 | 0.946 | 0.832 |
| 2.161415745669782 | 1.12 | 0.947 | 0.833 |
| 2.164557338323372 | 1.121 | 0.948 | 0.834 |
| 2.167698930976961 | 1.123 | 0.949 | 0.834 |
| 2.170840523630551 | 1.124 | 0.95 | 0.835 |
| 2.173982116284141 | 1.125 | 0.951 | 0.836 |
| 2.17712370893773 | 1.127 | 0.952 | 0.837 |
| 2.18026530159132 | 1.128 | 0.953 | 0.838 |
| 2.183406894244909 | 1.129 | 0.954 | 0.839 |
| 2.186548486898499 | 1.131 | 0.955 | 0.84 |
| 2.189690079552089 | 1.132 | 0.956 | 0.84 |
| 2.192831672205678 | 1.133 | 0.958 | 0.841 |
| 2.195973264859268 | 1.135 | 0.959 | 0.842 |
| 2.199114857512857 | 1.136 | 0.96 | 0.843 |
| 2.202256450166447 | 1.138 | 0.961 | 0.844 |
| 2.205398042820036 | 1.139 | 0.962 | 0.845 |
| 2.208539635473626 | 1.14 | 0.963 | 0.846 |
| 2.211681228127216 | 1.142 | 0.964 | 0.846 |
| 2.214822820780805 | 1.143 | 0.965 | 0.847 |
| 2.217964413434395 | 1.144 | 0.966 | 0.848 |
| 2.221106006087984 | 1.146 | 0.967 | 0.849 |
| 2.224247598741574 | 1.147 | 0.968 | 0.85 |
| 2.227389191395164 | 1.149 | 0.969 | 0.851 |
| 2.230530784048753 | 1.15 | 0.97 | 0.852 |
| 2.233672376702343 | 1.151 | 0.971 | 0.853 |
| 2.236813969355933 | 1.153 | 0.973 | 0.854 |
| 2.239955562009522 | 1.154 | 0.974 | 0.855 |
| 2.243097154663112 | 1.156 | 0.975 | 0.855 |
| 2.246238747316701 | 1.157 | 0.976 | 0.856 |
| 2.249380339970291 | 1.158 | 0.977 | 0.857 |
| 2.252521932623881 | 1.16 | 0.978 | 0.858 |
| 2.25566352527747 | 1.161 | 0.979 | 0.859 |
| 2.25880511793106 | 1.163 | 0.98 | 0.86 |
| 2.261946710584649 | 1.164 | 0.982 | 0.861 |
| 2.265088303238239 | 1.166 | 0.983 | 0.862 |
| 2.268229895891829 | 1.167 | 0.984 | 0.863 |
| 2.271371488545418 | 1.168 | 0.985 | 0.864 |
| 2.274513081199008 | 1.17 | 0.986 | 0.865 |
| 2.277654673852597 | 1.171 | 0.987 | 0.866 |
| 2.280796266506186 | 1.173 | 0.988 | 0.867 |
| 2.283937859159776 | 1.174 | 0.99 | 0.868 |
| 2.287079451813366 | 1.176 | 0.991 | 0.869 |
| 2.290221044466955 | 1.177 | 0.992 | 0.869 |
| 2.293362637120545 | 1.179 | 0.993 | 0.87 |
| 2.296504229774135 | 1.18 | 0.994 | 0.871 |
| 2.299645822427724 | 1.182 | 0.995 | 0.872 |
| 2.302787415081314 | 1.183 | 0.997 | 0.873 |
| 2.305929007734904 | 1.185 | 0.998 | 0.874 |
| 2.309070600388493 | 1.186 | 0.999 | 0.875 |
| 2.312212193042083 | 1.188 | 1 | 0.876 |
| 2.315353785695672 | 1.189 | 1.001 | 0.877 |
| 2.318495378349262 | 1.191 | 1.002 | 0.878 |
| 2.321636971002852 | 1.192 | 1.004 | 0.879 |
| 2.324778563656441 | 1.194 | 1.005 | 0.88 |
| 2.327920156310031 | 1.195 | 1.006 | 0.881 |
| 2.33106174896362 | 1.197 | 1.007 | 0.882 |
| 2.33420334161721 | 1.198 | 1.009 | 0.883 |
| 2.3373449342708 | 1.2 | 1.01 | 0.884 |
| 2.340486526924389 | 1.201 | 1.011 | 0.885 |
| 2.343628119577979 | 1.203 | 1.012 | 0.886 |
| 2.346769712231568 | 1.205 | 1.013 | 0.887 |
| 2.349911304885158 | 1.206 | 1.015 | 0.888 |
| 2.353052897538748 | 1.208 | 1.016 | 0.89 |
| 2.356194490192337 | 1.209 | 1.017 | 0.891 |
| 2.359336082845927 | 1.211 | 1.018 | 0.892 |
| 2.362477675499516 | 1.212 | 1.02 | 0.893 |
| 2.365619268153106 | 1.214 | 1.021 | 0.894 |
| 2.368760860806696 | 1.216 | 1.022 | 0.895 |
| 2.371902453460285 | 1.217 | 1.024 | 0.896 |
| 2.375044046113875 | 1.219 | 1.025 | 0.897 |
| 2.378185638767464 | 1.22 | 1.026 | 0.898 |
| 2.381327231421054 | 1.222 | 1.027 | 0.899 |
| 2.384468824074644 | 1.224 | 1.029 | 0.9 |
| 2.387610416728233 | 1.225 | 1.03 | 0.901 |
| 2.390752009381823 | 1.227 | 1.031 | 0.902 |
| 2.393893602035412 | 1.228 | 1.033 | 0.903 |
| 2.397035194689002 | 1.23 | 1.034 | 0.905 |
| 2.400176787342591 | 1.232 | 1.035 | 0.906 |
| 2.403318379996181 | 1.233 | 1.037 | 0.907 |
| 2.406459972649771 | 1.235 | 1.038 | 0.908 |
| 2.40960156530336 | 1.237 | 1.039 | 0.909 |
| 2.41274315795695 | 1.238 | 1.041 | 0.91 |
| 2.41588475061054 | 1.24 | 1.042 | 0.911 |
| 2.419026343264129 | 1.242 | 1.043 | 0.912 |
| 2.422167935917719 | 1.243 | 1.045 | 0.914 |
| 2.425309528571308 | 1.245 | 1.046 | 0.915 |
| 2.428451121224898 | 1.247 | 1.047 | 0.916 |
| 2.431592713878488 | 1.248 | 1.049 | 0.917 |
| 2.434734306532077 | 1.25 | 1.05 | 0.918 |
| 2.437875899185667 | 1.252 | 1.052 | 0.919 |
| 2.441017491839256 | 1.254 | 1.053 | 0.921 |
| 2.444159084492846 | 1.255 | 1.054 | 0.922 |
| 2.447300677146435 | 1.257 | 1.056 | 0.923 |
| 2.450442269800025 | 1.259 | 1.057 | 0.924 |
| 2.453583862453615 | 1.26 | 1.059 | 0.925 |
| 2.456725455107204 | 1.262 | 1.06 | 0.927 |
| 2.459867047760794 | 1.264 | 1.061 | 0.928 |
| 2.463008640414384 | 1.266 | 1.063 | 0.929 |
| 2.466150233067973 | 1.267 | 1.064 | 0.93 |
| 2.469291825721563 | 1.269 | 1.066 | 0.931 |
| 2.472433418375152 | 1.271 | 1.067 | 0.933 |
| 2.475575011028742 | 1.273 | 1.069 | 0.934 |
| 2.478716603682332 | 1.275 | 1.07 | 0.935 |
| 2.481858196335921 | 1.276 | 1.072 | 0.936 |
| 2.48499978898951 | 1.278 | 1.073 | 0.938 |
| 2.4881413816431 | 1.28 | 1.075 | 0.939 |
| 2.49128297429669 | 1.282 | 1.076 | 0.94 |
| 2.49442456695028 | 1.284 | 1.078 | 0.941 |
| 2.497566159603869 | 1.285 | 1.079 | 0.943 |
| 2.500707752257458 | 1.287 | 1.081 | 0.944 |
| 2.503849344911048 | 1.289 | 1.082 | 0.945 |
| 2.506990937564638 | 1.291 | 1.084 | 0.947 |
| 2.510132530218228 | 1.293 | 1.085 | 0.948 |
| 2.513274122871817 | 1.295 | 1.087 | 0.949 |
| 2.516415715525407 | 1.296 | 1.088 | 0.951 |
| 2.519557308178996 | 1.298 | 1.09 | 0.952 |
| 2.522698900832586 | 1.3 | 1.091 | 0.953 |
| 2.525840493486176 | 1.302 | 1.093 | 0.955 |
| 2.528982086139765 | 1.304 | 1.095 | 0.956 |
| 2.532123678793355 | 1.306 | 1.096 | 0.957 |
| 2.535265271446944 | 1.308 | 1.098 | 0.959 |
| 2.538406864100534 | 1.31 | 1.099 | 0.96 |
| 2.541548456754124 | 1.312 | 1.101 | 0.961 |
| 2.544690049407713 | 1.313 | 1.103 | 0.963 |
| 2.547831642061302 | 1.315 | 1.104 | 0.964 |
| 2.550973234714892 | 1.317 | 1.106 | 0.966 |
| 2.554114827368482 | 1.319 | 1.107 | 0.967 |
| 2.557256420022072 | 1.321 | 1.109 | 0.968 |
| 2.560398012675661 | 1.323 | 1.111 | 0.97 |
| 2.563539605329251 | 1.325 | 1.112 | 0.971 |
| 2.56668119798284 | 1.327 | 1.114 | 0.973 |
| 2.56982279063643 | 1.329 | 1.116 | 0.974 |
| 2.57296438329002 | 1.331 | 1.117 | 0.976 |
| 2.576105975943609 | 1.333 | 1.119 | 0.977 |
| 2.579247568597199 | 1.335 | 1.121 | 0.978 |
| 2.582389161250788 | 1.337 | 1.122 | 0.98 |
| 2.585530753904377 | 1.339 | 1.124 | 0.981 |
| 2.588672346557967 | 1.341 | 1.126 | 0.983 |
| 2.591813939211557 | 1.343 | 1.128 | 0.984 |
| 2.594955531865147 | 1.345 | 1.129 | 0.986 |
| 2.598097124518736 | 1.347 | 1.131 | 0.987 |
| 2.601238717172326 | 1.349 | 1.133 | 0.989 |
| 2.604380309825915 | 1.351 | 1.135 | 0.99 |
| 2.607521902479505 | 1.353 | 1.136 | 0.992 |
| 2.610663495133095 | 1.355 | 1.138 | 0.994 |
| 2.613805087786684 | 1.358 | 1.14 | 0.995 |
| 2.616946680440274 | 1.36 | 1.142 | 0.997 |
| 2.620088273093863 | 1.362 | 1.143 | 0.998 |
| 2.623229865747452 | 1.364 | 1.145 | 1 |
| 2.626371458401042 | 1.366 | 1.147 | 1.001 |
| 2.629513051054632 | 1.368 | 1.149 | 1.003 |
| 2.632654643708222 | 1.37 | 1.151 | 1.005 |
| 2.635796236361811 | 1.372 | 1.153 | 1.006 |
| 2.638937829015401 | 1.374 | 1.154 | 1.008 |
| 2.642079421668991 | 1.377 | 1.156 | 1.01 |
| 2.64522101432258 | 1.379 | 1.158 | 1.011 |
| 2.64836260697617 | 1.381 | 1.16 | 1.013 |
| 2.651504199629759 | 1.383 | 1.162 | 1.014 |
| 2.654645792283349 | 1.385 | 1.164 | 1.016 |
| 2.657787384936938 | 1.387 | 1.166 | 1.018 |
| 2.660928977590528 | 1.39 | 1.168 | 1.02 |
| 2.664070570244118 | 1.392 | 1.17 | 1.021 |
| 2.667212162897707 | 1.394 | 1.171 | 1.023 |
| 2.670353755551297 | 1.396 | 1.173 | 1.025 |
| 2.673495348204887 | 1.399 | 1.175 | 1.026 |
| 2.676636940858476 | 1.401 | 1.177 | 1.028 |
| 2.679778533512066 | 1.403 | 1.179 | 1.03 |
| 2.682920126165655 | 1.405 | 1.181 | 1.032 |
| 2.686061718819245 | 1.408 | 1.183 | 1.033 |
| 2.689203311472835 | 1.41 | 1.185 | 1.035 |
| 2.692344904126424 | 1.412 | 1.187 | 1.037 |
| 2.695486496780014 | 1.414 | 1.189 | 1.039 |
| 2.698628089433603 | 1.417 | 1.191 | 1.041 |
| 2.701769682087193 | 1.419 | 1.193 | 1.042 |
| 2.704911274740782 | 1.421 | 1.195 | 1.044 |
| 2.708052867394372 | 1.424 | 1.197 | 1.046 |
| 2.711194460047962 | 1.426 | 1.199 | 1.048 |
| 2.714336052701551 | 1.428 | 1.201 | 1.05 |
| 2.717477645355141 | 1.431 | 1.204 | 1.052 |
| 2.720619238008731 | 1.433 | 1.206 | 1.053 |
| 2.72376083066232 | 1.435 | 1.208 | 1.055 |
| 2.72690242331591 | 1.438 | 1.21 | 1.057 |
| 2.730044015969499 | 1.44 | 1.212 | 1.059 |
| 2.733185608623089 | 1.442 | 1.214 | 1.061 |
| 2.736327201276678 | 1.445 | 1.216 | 1.063 |
| 2.739468793930268 | 1.447 | 1.218 | 1.065 |
| 2.742610386583858 | 1.45 | 1.221 | 1.067 |
| 2.745751979237447 | 1.452 | 1.223 | 1.069 |
| 2.748893571891036 | 1.454 | 1.225 | 1.071 |
| 2.752035164544627 | 1.457 | 1.227 | 1.073 |
| 2.755176757198216 | 1.459 | 1.229 | 1.075 |
| 2.758318349851806 | 1.462 | 1.231 | 1.077 |
| 2.761459942505395 | 1.464 | 1.234 | 1.079 |
| 2.764601535158985 | 1.467 | 1.236 | 1.081 |
| 2.767743127812574 | 1.469 | 1.238 | 1.083 |
| 2.770884720466164 | 1.472 | 1.24 | 1.085 |
| 2.774026313119754 | 1.474 | 1.243 | 1.087 |
| 2.777167905773343 | 1.477 | 1.245 | 1.089 |
| 2.780309498426932 | 1.479 | 1.247 | 1.091 |
| 2.783451091080522 | 1.482 | 1.25 | 1.093 |
| 2.786592683734112 | 1.484 | 1.252 | 1.095 |
| 2.789734276387701 | 1.487 | 1.254 | 1.098 |
| 2.792875869041291 | 1.489 | 1.256 | 1.1 |
| 2.796017461694881 | 1.492 | 1.259 | 1.102 |
| 2.79915905434847 | 1.494 | 1.261 | 1.104 |
| 2.80230064700206 | 1.497 | 1.263 | 1.106 |
| 2.80544223965565 | 1.5 | 1.266 | 1.108 |
| 2.808583832309239 | 1.502 | 1.268 | 1.111 |
| 2.811725424962829 | 1.505 | 1.271 | 1.113 |
| 2.814867017616419 | 1.507 | 1.273 | 1.115 |
| 2.818008610270008 | 1.51 | 1.275 | 1.117 |
| 2.821150202923598 | 1.513 | 1.278 | 1.119 |
| 2.824291795577187 | 1.515 | 1.28 | 1.122 |
| 2.827433388230777 | 1.518 | 1.283 | 1.124 |
| 2.830574980884366 | 1.52 | 1.285 | 1.126 |
| 2.833716573537956 | 1.523 | 1.288 | 1.129 |
| 2.836858166191546 | 1.526 | 1.29 | 1.131 |
| 2.839999758845135 | 1.528 | 1.293 | 1.133 |
| 2.843141351498725 | 1.531 | 1.295 | 1.135 |
| 2.846282944152314 | 1.534 | 1.298 | 1.138 |
| 2.849424536805904 | 1.537 | 1.3 | 1.14 |
| 2.852566129459494 | 1.539 | 1.303 | 1.143 |
| 2.855707722113083 | 1.542 | 1.305 | 1.145 |
| 2.858849314766673 | 1.545 | 1.308 | 1.147 |
| 2.861990907420262 | 1.547 | 1.31 | 1.15 |
| 2.865132500073852 | 1.55 | 1.313 | 1.152 |
| 2.868274092727442 | 1.553 | 1.315 | 1.155 |
| 2.871415685381031 | 1.556 | 1.318 | 1.157 |
| 2.874557278034621 | 1.558 | 1.32 | 1.159 |
| 2.87769887068821 | 1.561 | 1.323 | 1.162 |
| 2.8808404633418 | 1.564 | 1.326 | 1.164 |
| 2.88398205599539 | 1.567 | 1.328 | 1.167 |
| 2.88712364864898 | 1.569 | 1.331 | 1.169 |
| 2.890265241302569 | 1.572 | 1.334 | 1.172 |
| 2.893406833956158 | 1.575 | 1.336 | 1.174 |
| 2.896548426609748 | 1.578 | 1.339 | 1.177 |
| 2.899690019263338 | 1.581 | 1.342 | 1.179 |
| 2.902831611916927 | 1.583 | 1.344 | 1.182 |
| 2.905973204570517 | 1.586 | 1.347 | 1.185 |
| 2.909114797224106 | 1.589 | 1.35 | 1.187 |
| 2.912256389877696 | 1.592 | 1.352 | 1.19 |
| 2.915397982531286 | 1.595 | 1.355 | 1.192 |
| 2.918539575184875 | 1.598 | 1.358 | 1.195 |
| 2.921681167838465 | 1.601 | 1.361 | 1.198 |
| 2.924822760492054 | 1.603 | 1.363 | 1.2 |
| 2.927964353145644 | 1.606 | 1.366 | 1.203 |
| 2.931105945799234 | 1.609 | 1.369 | 1.206 |
| 2.934247538452823 | 1.612 | 1.372 | 1.208 |
| 2.937389131106413 | 1.615 | 1.374 | 1.211 |
| 2.940530723760002 | 1.618 | 1.377 | 1.214 |
| 2.943672316413592 | 1.621 | 1.38 | 1.216 |
| 2.946813909067182 | 1.624 | 1.383 | 1.219 |
| 2.949955501720771 | 1.627 | 1.386 | 1.222 |
| 2.953097094374361 | 1.63 | 1.389 | 1.225 |
| 2.95623868702795 | 1.632 | 1.391 | 1.227 |
| 2.95938027968154 | 1.635 | 1.394 | 1.23 |
| 2.96252187233513 | 1.638 | 1.397 | 1.233 |
| 2.965663464988719 | 1.641 | 1.4 | 1.236 |
| 2.968805057642309 | 1.644 | 1.403 | 1.239 |
| 2.971946650295898 | 1.647 | 1.406 | 1.241 |
| 2.975088242949488 | 1.65 | 1.409 | 1.244 |
| 2.978229835603078 | 1.653 | 1.412 | 1.247 |
| 2.981371428256667 | 1.656 | 1.414 | 1.25 |
| 2.984513020910257 | 1.659 | 1.417 | 1.253 |
| 2.987654613563846 | 1.662 | 1.42 | 1.256 |
| 2.990796206217436 | 1.665 | 1.423 | 1.258 |
| 2.993937798871025 | 1.668 | 1.426 | 1.261 |
| 2.997079391524615 | 1.671 | 1.429 | 1.264 |
| 3.000220984178205 | 1.674 | 1.432 | 1.267 |
| 3.003362576831794 | 1.677 | 1.435 | 1.27 |
| 3.006504169485384 | 1.68 | 1.438 | 1.273 |
| 3.009645762138974 | 1.683 | 1.441 | 1.276 |
| 3.012787354792563 | 1.686 | 1.444 | 1.279 |
| 3.015928947446153 | 1.689 | 1.447 | 1.282 |
| 3.019070540099742 | 1.692 | 1.45 | 1.285 |
| 3.022212132753332 | 1.696 | 1.453 | 1.288 |
| 3.025353725406922 | 1.699 | 1.456 | 1.291 |
| 3.028495318060511 | 1.702 | 1.459 | 1.294 |
| 3.031636910714101 | 1.705 | 1.462 | 1.297 |
| 3.03477850336769 | 1.708 | 1.465 | 1.3 |
| 3.03792009602128 | 1.711 | 1.468 | 1.303 |
| 3.04106168867487 | 1.714 | 1.471 | 1.306 |
| 3.04420328132846 | 1.717 | 1.474 | 1.309 |
| 3.047344873982049 | 1.72 | 1.477 | 1.312 |
| 3.050486466635638 | 1.723 | 1.48 | 1.315 |
| 3.053628059289228 | 1.726 | 1.484 | 1.318 |
| 3.056769651942818 | 1.729 | 1.487 | 1.321 |
| 3.059911244596407 | 1.732 | 1.49 | 1.324 |
| 3.063052837249997 | 1.736 | 1.493 | 1.327 |
| 3.066194429903586 | 1.739 | 1.496 | 1.33 |
| 3.069336022557176 | 1.742 | 1.499 | 1.333 |
| 3.072477615210766 | 1.745 | 1.502 | 1.336 |
| 3.075619207864355 | 1.748 | 1.505 | 1.339 |
| 3.078760800517945 | 1.751 | 1.508 | 1.342 |
| 3.081902393171534 | 1.754 | 1.511 | 1.346 |
| 3.085043985825124 | 1.757 | 1.514 | 1.349 |
| 3.088185578478713 | 1.76 | 1.518 | 1.352 |
| 3.091327171132303 | 1.764 | 1.521 | 1.355 |
| 3.094468763785893 | 1.767 | 1.524 | 1.358 |
| 3.097610356439482 | 1.77 | 1.527 | 1.361 |
| 3.100751949093072 | 1.773 | 1.53 | 1.364 |
| 3.103893541746661 | 1.776 | 1.533 | 1.367 |
| 3.107035134400251 | 1.779 | 1.536 | 1.37 |
| 3.110176727053841 | 1.782 | 1.539 | 1.374 |
| 3.11331831970743 | 1.786 | 1.543 | 1.377 |
| 3.11645991236102 | 1.789 | 1.546 | 1.38 |
| 3.11960150501461 | 1.792 | 1.549 | 1.383 |
| 3.122743097668199 | 1.795 | 1.552 | 1.386 |
| 3.125884690321789 | 1.798 | 1.555 | 1.389 |
| 3.129026282975378 | 1.801 | 1.558 | 1.392 |
| 3.132167875628968 | 1.804 | 1.561 | 1.396 |
| 3.135309468282557 | 1.808 | 1.565 | 1.399 |
| 3.138451060936147 | 1.811 | 1.568 | 1.402 |
| 3.141592653589737 | 1.814 | 1.571 | 1.405 |
| 3.144734246243326 | 1.817 | 1.574 | 1.408 |
| 3.147875838896916 | 1.82 | 1.577 | 1.411 |
| 3.151017431550505 | 1.823 | 1.58 | 1.414 |
| 3.154159024204095 | 1.826 | 1.583 | 1.418 |
| 3.157300616857685 | 1.83 | 1.587 | 1.421 |
| 3.160442209511274 | 1.833 | 1.59 | 1.424 |
| 3.163583802164864 | 1.836 | 1.593 | 1.427 |
| 3.166725394818453 | 1.839 | 1.596 | 1.43 |
| 3.169866987472043 | 1.842 | 1.599 | 1.433 |
| 3.173008580125633 | 1.845 | 1.602 | 1.436 |
| 3.176150172779222 | 1.848 | 1.605 | 1.439 |
| 3.179291765432812 | 1.851 | 1.608 | 1.443 |
| 3.182433358086401 | 1.855 | 1.612 | 1.446 |
| 3.185574950739991 | 1.858 | 1.615 | 1.449 |
| 3.188716543393581 | 1.861 | 1.618 | 1.452 |
| 3.19185813604717 | 1.864 | 1.621 | 1.455 |
| 3.19499972870076 | 1.867 | 1.624 | 1.458 |
| 3.198141321354349 | 1.87 | 1.627 | 1.461 |
| 3.20128291400794 | 1.873 | 1.63 | 1.464 |
| 3.204424506661528 | 1.876 | 1.633 | 1.467 |
| 3.207566099315118 | 1.88 | 1.636 | 1.471 |
| 3.210707691968708 | 1.883 | 1.64 | 1.474 |
| 3.213849284622297 | 1.886 | 1.643 | 1.477 |
| 3.216990877275887 | 1.889 | 1.646 | 1.48 |
| 3.220132469929476 | 1.892 | 1.649 | 1.483 |
| 3.223274062583066 | 1.895 | 1.652 | 1.486 |
| 3.226415655236656 | 1.898 | 1.655 | 1.489 |
| 3.229557247890245 | 1.901 | 1.658 | 1.492 |
| 3.232698840543835 | 1.904 | 1.661 | 1.495 |
| 3.235840433197425 | 1.907 | 1.664 | 1.498 |
| 3.238982025851014 | 1.911 | 1.667 | 1.501 |
| 3.242123618504604 | 1.914 | 1.67 | 1.504 |
| 3.245265211158193 | 1.917 | 1.673 | 1.507 |
| 3.248406803811783 | 1.92 | 1.676 | 1.51 |
| 3.251548396465373 | 1.923 | 1.679 | 1.513 |
| 3.254689989118962 | 1.926 | 1.682 | 1.516 |
| 3.257831581772551 | 1.929 | 1.686 | 1.519 |
| 3.260973174426141 | 1.932 | 1.689 | 1.522 |
| 3.26411476707973 | 1.935 | 1.692 | 1.525 |
| 3.267256359733321 | 1.938 | 1.695 | 1.528 |
| 3.27039795238691 | 1.941 | 1.698 | 1.531 |
| 3.2735395450405 | 1.944 | 1.701 | 1.534 |
| 3.276681137694089 | 1.947 | 1.704 | 1.537 |
| 3.279822730347679 | 1.95 | 1.706 | 1.54 |
| 3.282964323001269 | 1.953 | 1.709 | 1.543 |
| 3.286105915654858 | 1.956 | 1.712 | 1.546 |
| 3.289247508308448 | 1.959 | 1.715 | 1.549 |
| 3.292389100962037 | 1.962 | 1.718 | 1.551 |
| 3.295530693615627 | 1.965 | 1.721 | 1.554 |
| 3.298672286269217 | 1.968 | 1.724 | 1.557 |
| 3.301813878922806 | 1.971 | 1.727 | 1.56 |
| 3.304955471576396 | 1.974 | 1.73 | 1.563 |
| 3.308097064229985 | 1.977 | 1.733 | 1.566 |
| 3.311238656883575 | 1.98 | 1.736 | 1.569 |
| 3.314380249537165 | 1.983 | 1.739 | 1.571 |
| 3.317521842190754 | 1.986 | 1.742 | 1.574 |
| 3.320663434844344 | 1.989 | 1.744 | 1.577 |
| 3.323805027497933 | 1.992 | 1.747 | 1.58 |
| 3.326946620151523 | 1.995 | 1.75 | 1.583 |
| 3.330088212805113 | 1.998 | 1.753 | 1.585 |
| 3.333229805458702 | 2.001 | 1.756 | 1.588 |
| 3.336371398112292 | 2.004 | 1.759 | 1.591 |
| 3.339512990765881 | 2.007 | 1.762 | 1.593 |
| 3.342654583419471 | 2.01 | 1.764 | 1.596 |
| 3.345796176073061 | 2.013 | 1.767 | 1.599 |
| 3.34893776872665 | 2.016 | 1.77 | 1.602 |
| 3.35207936138024 | 2.018 | 1.773 | 1.604 |
| 3.355220954033829 | 2.021 | 1.775 | 1.607 |
| 3.358362546687419 | 2.024 | 1.778 | 1.61 |
| 3.361504139341009 | 2.027 | 1.781 | 1.612 |
| 3.364645731994598 | 2.03 | 1.784 | 1.615 |
| 3.367787324648188 | 2.033 | 1.786 | 1.618 |
| 3.370928917301777 | 2.036 | 1.789 | 1.62 |
| 3.374070509955367 | 2.038 | 1.792 | 1.623 |
| 3.377212102608956 | 2.041 | 1.795 | 1.625 |
| 3.380353695262546 | 2.044 | 1.797 | 1.628 |
| 3.383495287916136 | 2.047 | 1.8 | 1.63 |
| 3.386636880569725 | 2.05 | 1.803 | 1.633 |
| 3.389778473223315 | 2.053 | 1.805 | 1.636 |
| 3.392920065876904 | 2.055 | 1.808 | 1.638 |
| 3.396061658530494 | 2.058 | 1.811 | 1.641 |
| 3.399203251184084 | 2.061 | 1.813 | 1.643 |
| 3.402344843837673 | 2.064 | 1.816 | 1.646 |
| 3.405486436491263 | 2.067 | 1.819 | 1.648 |
| 3.408628029144852 | 2.069 | 1.821 | 1.65 |
| 3.411769621798442 | 2.072 | 1.824 | 1.653 |
| 3.414911214452032 | 2.075 | 1.826 | 1.655 |
| 3.418052807105621 | 2.078 | 1.829 | 1.658 |
| 3.421194399759211 | 2.08 | 1.831 | 1.66 |
| 3.4243359924128 | 2.083 | 1.834 | 1.663 |
| 3.42747758506639 | 2.086 | 1.837 | 1.665 |
| 3.43061917771998 | 2.088 | 1.839 | 1.667 |
| 3.433760770373569 | 2.091 | 1.842 | 1.67 |
| 3.436902363027159 | 2.094 | 1.844 | 1.672 |
| 3.440043955680748 | 2.096 | 1.847 | 1.674 |
| 3.443185548334338 | 2.099 | 1.849 | 1.677 |
| 3.446327140987927 | 2.102 | 1.852 | 1.679 |
| 3.449468733641517 | 2.104 | 1.854 | 1.681 |
| 3.452610326295107 | 2.107 | 1.856 | 1.684 |
| 3.455751918948696 | 2.11 | 1.859 | 1.686 |
| 3.458893511602286 | 2.112 | 1.861 | 1.688 |
| 3.462035104255876 | 2.115 | 1.864 | 1.69 |
| 3.465176696909465 | 2.118 | 1.866 | 1.693 |
| 3.468318289563055 | 2.12 | 1.869 | 1.695 |
| 3.471459882216644 | 2.123 | 1.871 | 1.697 |
| 3.474601474870234 | 2.125 | 1.873 | 1.699 |
| 3.477743067523824 | 2.128 | 1.876 | 1.702 |
| 3.480884660177413 | 2.131 | 1.878 | 1.704 |
| 3.484026252831002 | 2.133 | 1.88 | 1.706 |
| 3.487167845484592 | 2.136 | 1.883 | 1.708 |
| 3.490309438138182 | 2.138 | 1.885 | 1.71 |
| 3.493451030791772 | 2.141 | 1.887 | 1.712 |
| 3.496592623445361 | 2.143 | 1.89 | 1.714 |
| 3.499734216098951 | 2.146 | 1.892 | 1.717 |
| 3.50287580875254 | 2.148 | 1.894 | 1.719 |
| 3.50601740140613 | 2.151 | 1.897 | 1.721 |
| 3.50915899405972 | 2.153 | 1.899 | 1.723 |
| 3.512300586713309 | 2.156 | 1.901 | 1.725 |
| 3.515442179366899 | 2.158 | 1.903 | 1.727 |
| 3.518583772020488 | 2.161 | 1.906 | 1.729 |
| 3.521725364674078 | 2.163 | 1.908 | 1.731 |
| 3.524866957327668 | 2.166 | 1.91 | 1.733 |
| 3.528008549981257 | 2.168 | 1.912 | 1.735 |
| 3.531150142634847 | 2.171 | 1.915 | 1.737 |
| 3.534291735288436 | 2.173 | 1.917 | 1.739 |
| 3.537433327942026 | 2.176 | 1.919 | 1.741 |
| 3.540574920595616 | 2.178 | 1.921 | 1.743 |
| 3.543716513249205 | 2.18 | 1.923 | 1.745 |
| 3.546858105902795 | 2.183 | 1.925 | 1.747 |
| 3.549999698556384 | 2.185 | 1.928 | 1.749 |
| 3.553141291209974 | 2.188 | 1.93 | 1.751 |
| 3.556282883863564 | 2.19 | 1.932 | 1.753 |
| 3.559424476517153 | 2.192 | 1.934 | 1.755 |
| 3.562566069170743 | 2.195 | 1.936 | 1.756 |
| 3.565707661824332 | 2.197 | 1.938 | 1.758 |
| 3.568849254477922 | 2.199 | 1.94 | 1.76 |
| 3.571990847131511 | 2.202 | 1.942 | 1.762 |
| 3.575132439785101 | 2.204 | 1.944 | 1.764 |
| 3.578274032438691 | 2.206 | 1.946 | 1.766 |
| 3.58141562509228 | 2.209 | 1.948 | 1.768 |
| 3.58455721774587 | 2.211 | 1.95 | 1.769 |
| 3.58769881039946 | 2.213 | 1.952 | 1.771 |
| 3.590840403053049 | 2.215 | 1.954 | 1.773 |
| 3.593981995706639 | 2.218 | 1.956 | 1.775 |
| 3.597123588360228 | 2.22 | 1.958 | 1.777 |
| 3.600265181013818 | 2.222 | 1.96 | 1.778 |
| 3.603406773667407 | 2.225 | 1.962 | 1.78 |
| 3.606548366320997 | 2.227 | 1.964 | 1.782 |
| 3.609689958974587 | 2.229 | 1.966 | 1.784 |
| 3.612831551628176 | 2.231 | 1.968 | 1.785 |
| 3.615973144281766 | 2.233 | 1.97 | 1.787 |
| 3.619114736935355 | 2.236 | 1.972 | 1.789 |
| 3.622256329588945 | 2.238 | 1.974 | 1.79 |
| 3.625397922242534 | 2.24 | 1.976 | 1.792 |
| 3.628539514896124 | 2.242 | 1.978 | 1.794 |
| 3.631681107549714 | 2.244 | 1.98 | 1.795 |
| 3.634822700203303 | 2.247 | 1.982 | 1.797 |
| 3.637964292856893 | 2.249 | 1.983 | 1.799 |
| 3.641105885510483 | 2.251 | 1.985 | 1.8 |
| 3.644247478164072 | 2.253 | 1.987 | 1.802 |
| 3.647389070817662 | 2.255 | 1.989 | 1.804 |
| 3.650530663471251 | 2.257 | 1.991 | 1.805 |
| 3.653672256124841 | 2.26 | 1.993 | 1.807 |
| 3.656813848778431 | 2.262 | 1.995 | 1.808 |
| 3.65995544143202 | 2.264 | 1.996 | 1.81 |
| 3.66309703408561 | 2.266 | 1.998 | 1.812 |
| 3.666238626739199 | 2.268 | 2 | 1.813 |
| 3.66938021939279 | 2.27 | 2.002 | 1.815 |
| 3.672521812046378 | 2.272 | 2.003 | 1.816 |
| 3.675663404699968 | 2.274 | 2.005 | 1.818 |
| 3.678804997353558 | 2.276 | 2.007 | 1.819 |
| 3.681946590007147 | 2.278 | 2.009 | 1.821 |
| 3.685088182660737 | 2.28 | 2.011 | 1.822 |
| 3.688229775314326 | 2.282 | 2.012 | 1.824 |
| 3.691371367967916 | 2.284 | 2.014 | 1.826 |
| 3.694512960621506 | 2.286 | 2.016 | 1.827 |
| 3.697654553275095 | 2.288 | 2.017 | 1.828 |
| 3.700796145928685 | 2.291 | 2.019 | 1.83 |
| 3.703937738582274 | 2.293 | 2.021 | 1.831 |
| 3.707079331235864 | 2.295 | 2.023 | 1.833 |
| 3.710220923889454 | 2.297 | 2.024 | 1.834 |
| 3.713362516543043 | 2.298 | 2.026 | 1.836 |
| 3.716504109196633 | 2.3 | 2.028 | 1.837 |
| 3.719645701850223 | 2.302 | 2.029 | 1.839 |
| 3.722787294503812 | 2.304 | 2.031 | 1.84 |
| 3.725928887157402 | 2.306 | 2.033 | 1.842 |
| 3.729070479810991 | 2.308 | 2.034 | 1.843 |
| 3.732212072464581 | 2.31 | 2.036 | 1.844 |
| 3.735353665118171 | 2.312 | 2.037 | 1.846 |
| 3.73849525777176 | 2.314 | 2.039 | 1.847 |
| 3.74163685042535 | 2.316 | 2.041 | 1.849 |
| 3.744778443078939 | 2.318 | 2.042 | 1.85 |
| 3.747920035732529 | 2.32 | 2.044 | 1.851 |
| 3.751061628386119 | 2.322 | 2.045 | 1.853 |
| 3.754203221039708 | 2.324 | 2.047 | 1.854 |
| 3.757344813693298 | 2.326 | 2.049 | 1.855 |
| 3.760486406346887 | 2.327 | 2.05 | 1.857 |
| 3.763627999000477 | 2.329 | 2.052 | 1.858 |
| 3.766769591654067 | 2.331 | 2.053 | 1.859 |
| 3.769911184307656 | 2.333 | 2.055 | 1.861 |
| 3.773052776961246 | 2.335 | 2.056 | 1.862 |
| 3.776194369614835 | 2.337 | 2.058 | 1.863 |
| 3.779335962268425 | 2.339 | 2.059 | 1.865 |
| 3.782477554922014 | 2.34 | 2.061 | 1.866 |
| 3.785619147575604 | 2.342 | 2.062 | 1.867 |
| 3.788760740229193 | 2.344 | 2.064 | 1.868 |
| 3.791902332882783 | 2.346 | 2.065 | 1.87 |
| 3.795043925536373 | 2.348 | 2.067 | 1.871 |
| 3.798185518189962 | 2.349 | 2.068 | 1.872 |
| 3.801327110843552 | 2.351 | 2.07 | 1.874 |
| 3.804468703497142 | 2.353 | 2.071 | 1.875 |
| 3.807610296150731 | 2.355 | 2.073 | 1.876 |
| 3.810751888804321 | 2.357 | 2.074 | 1.877 |
| 3.813893481457911 | 2.358 | 2.076 | 1.879 |
| 3.8170350741115 | 2.36 | 2.077 | 1.88 |
| 3.82017666676509 | 2.362 | 2.079 | 1.881 |
| 3.823318259418679 | 2.364 | 2.08 | 1.882 |
| 3.826459852072269 | 2.365 | 2.082 | 1.883 |
| 3.829601444725859 | 2.367 | 2.083 | 1.885 |
| 3.832743037379448 | 2.369 | 2.084 | 1.886 |
| 3.835884630033038 | 2.371 | 2.086 | 1.887 |
| 3.839026222686627 | 2.372 | 2.087 | 1.888 |
| 3.842167815340217 | 2.374 | 2.089 | 1.889 |
| 3.845309407993807 | 2.376 | 2.09 | 1.891 |
| 3.848451000647396 | 2.378 | 2.091 | 1.892 |
| 3.851592593300986 | 2.379 | 2.093 | 1.893 |
| 3.854734185954575 | 2.381 | 2.094 | 1.894 |
| 3.857875778608165 | 2.383 | 2.096 | 1.895 |
| 3.861017371261755 | 2.384 | 2.097 | 1.896 |
| 3.864158963915344 | 2.386 | 2.098 | 1.898 |
| 3.867300556568933 | 2.388 | 2.1 | 1.899 |
| 3.870442149222523 | 2.389 | 2.101 | 1.9 |
| 3.873583741876112 | 2.391 | 2.102 | 1.901 |
| 3.876725334529703 | 2.393 | 2.104 | 1.902 |
| 3.879866927183292 | 2.394 | 2.105 | 1.903 |
| 3.883008519836882 | 2.396 | 2.106 | 1.904 |
| 3.886150112490471 | 2.398 | 2.108 | 1.905 |
| 3.889291705144061 | 2.399 | 2.109 | 1.906 |
| 3.892433297797651 | 2.401 | 2.11 | 1.908 |
| 3.89557489045124 | 2.402 | 2.112 | 1.909 |
| 3.89871648310483 | 2.404 | 2.113 | 1.91 |
| 3.901858075758419 | 2.406 | 2.114 | 1.911 |
| 3.904999668412009 | 2.407 | 2.115 | 1.912 |
| 3.908141261065598 | 2.409 | 2.117 | 1.913 |
| 3.911282853719188 | 2.41 | 2.118 | 1.914 |
| 3.914424446372778 | 2.412 | 2.119 | 1.915 |
| 3.917566039026367 | 2.414 | 2.121 | 1.916 |
| 3.920707631679957 | 2.415 | 2.122 | 1.917 |
| 3.923849224333547 | 2.417 | 2.123 | 1.918 |
| 3.926990816987136 | 2.418 | 2.124 | 1.919 |
| 3.930132409640726 | 2.42 | 2.126 | 1.92 |
| 3.933274002294315 | 2.422 | 2.127 | 1.921 |
| 3.936415594947905 | 2.423 | 2.128 | 1.922 |
| 3.939557187601495 | 2.425 | 2.129 | 1.924 |
| 3.942698780255084 | 2.426 | 2.131 | 1.925 |
| 3.945840372908674 | 2.428 | 2.132 | 1.926 |
| 3.948981965562263 | 2.429 | 2.133 | 1.927 |
| 3.952123558215853 | 2.431 | 2.134 | 1.928 |
| 3.955265150869442 | 2.432 | 2.135 | 1.929 |
| 3.958406743523032 | 2.434 | 2.137 | 1.93 |
| 3.961548336176622 | 2.435 | 2.138 | 1.931 |
| 3.964689928830211 | 2.437 | 2.139 | 1.932 |
| 3.967831521483801 | 2.438 | 2.14 | 1.933 |
| 3.97097311413739 | 2.44 | 2.142 | 1.934 |
| 3.97411470679098 | 2.441 | 2.143 | 1.935 |
| 3.97725629944457 | 2.443 | 2.144 | 1.936 |
| 3.98039789209816 | 2.444 | 2.145 | 1.937 |
| 3.983539484751749 | 2.446 | 2.146 | 1.938 |
| 3.986681077405338 | 2.447 | 2.147 | 1.939 |
| 3.989822670058928 | 2.449 | 2.149 | 1.939 |
| 3.992964262712517 | 2.45 | 2.15 | 1.94 |
| 3.996105855366107 | 2.452 | 2.151 | 1.941 |
| 3.999247448019697 | 2.453 | 2.152 | 1.942 |
| 4.002389040673287 | 2.455 | 2.153 | 1.943 |
| 4.005530633326877 | 2.456 | 2.154 | 1.944 |
| 4.008672225980466 | 2.458 | 2.156 | 1.945 |
| 4.011813818634056 | 2.459 | 2.157 | 1.946 |
| 4.014955411287645 | 2.461 | 2.158 | 1.947 |
| 4.018097003941234 | 2.462 | 2.159 | 1.948 |
| 4.021238596594824 | 2.463 | 2.16 | 1.949 |
| 4.024380189248414 | 2.465 | 2.161 | 1.95 |
| 4.027521781902004 | 2.466 | 2.162 | 1.951 |
| 4.030663374555593 | 2.468 | 2.163 | 1.952 |
| 4.033804967209183 | 2.469 | 2.165 | 1.953 |
| 4.036946559862773 | 2.471 | 2.166 | 1.954 |
| 4.040088152516362 | 2.472 | 2.167 | 1.954 |
| 4.043229745169951 | 2.473 | 2.168 | 1.955 |
| 4.046371337823541 | 2.475 | 2.169 | 1.956 |
| 4.049512930477131 | 2.476 | 2.17 | 1.957 |
| 4.05265452313072 | 2.478 | 2.171 | 1.958 |
| 4.05579611578431 | 2.479 | 2.172 | 1.959 |
| 4.0589377084379 | 2.48 | 2.173 | 1.96 |
| 4.062079301091489 | 2.482 | 2.174 | 1.961 |
| 4.065220893745079 | 2.483 | 2.176 | 1.962 |
| 4.068362486398668 | 2.485 | 2.177 | 1.963 |
| 4.071504079052258 | 2.486 | 2.178 | 1.963 |
| 4.074645671705848 | 2.487 | 2.179 | 1.964 |
| 4.077787264359437 | 2.489 | 2.18 | 1.965 |
| 4.080928857013027 | 2.49 | 2.181 | 1.966 |
| 4.084070449666616 | 2.491 | 2.182 | 1.967 |
| 4.087212042320206 | 2.493 | 2.183 | 1.968 |
| 4.090353634973795 | 2.494 | 2.184 | 1.969 |
| 4.093495227627385 | 2.495 | 2.185 | 1.97 |
| 4.096636820280975 | 2.497 | 2.186 | 1.97 |
| 4.099778412934564 | 2.498 | 2.187 | 1.971 |
| 4.102920005588154 | 2.499 | 2.188 | 1.972 |
| 4.106061598241744 | 2.501 | 2.189 | 1.973 |
| 4.109203190895333 | 2.502 | 2.19 | 1.974 |
| 4.112344783548923 | 2.503 | 2.191 | 1.975 |
| 4.115486376202512 | 2.505 | 2.192 | 1.975 |
| 4.118627968856102 | 2.506 | 2.193 | 1.976 |
| 4.121769561509692 | 2.507 | 2.194 | 1.977 |
| 4.124911154163281 | 2.509 | 2.195 | 1.978 |
| 4.128052746816871 | 2.51 | 2.197 | 1.979 |
| 4.13119433947046 | 2.511 | 2.198 | 1.98 |
| 4.13433593212405 | 2.513 | 2.199 | 1.98 |
| 4.13747752477764 | 2.514 | 2.2 | 1.981 |
| 4.14061911743123 | 2.515 | 2.201 | 1.982 |
| 4.143760710084818 | 2.517 | 2.202 | 1.983 |
| 4.146902302738408 | 2.518 | 2.203 | 1.984 |
| 4.150043895391998 | 2.519 | 2.204 | 1.985 |
| 4.153185488045588 | 2.521 | 2.205 | 1.985 |
| 4.156327080699177 | 2.522 | 2.206 | 1.986 |
| 4.159468673352766 | 2.523 | 2.207 | 1.987 |
| 4.162610266006356 | 2.524 | 2.208 | 1.988 |
| 4.165751858659946 | 2.526 | 2.209 | 1.989 |
| 4.168893451313535 | 2.527 | 2.21 | 1.989 |
| 4.172035043967125 | 2.528 | 2.21 | 1.99 |
| 4.175176636620715 | 2.529 | 2.211 | 1.991 |
| 4.178318229274304 | 2.531 | 2.212 | 1.992 |
| 4.181459821927894 | 2.532 | 2.213 | 1.993 |
| 4.184601414581484 | 2.533 | 2.214 | 1.993 |
| 4.187743007235073 | 2.535 | 2.215 | 1.994 |
| 4.190884599888663 | 2.536 | 2.216 | 1.995 |
| 4.194026192542252 | 2.537 | 2.217 | 1.996 |
| 4.197167785195842 | 2.538 | 2.218 | 1.997 |
| 4.200309377849432 | 2.54 | 2.219 | 1.997 |
| 4.203450970503021 | 2.541 | 2.22 | 1.998 |
| 4.206592563156611 | 2.542 | 2.221 | 1.999 |
| 4.2097341558102 | 2.543 | 2.222 | 2 |
| 4.21287574846379 | 2.544 | 2.223 | 2 |
| 4.21601734111738 | 2.546 | 2.224 | 2.001 |
| 4.21915893377097 | 2.547 | 2.225 | 2.002 |
| 4.222300526424559 | 2.548 | 2.226 | 2.003 |
| 4.225442119078148 | 2.549 | 2.227 | 2.003 |
| 4.228583711731738 | 2.551 | 2.228 | 2.004 |
| 4.231725304385327 | 2.552 | 2.229 | 2.005 |
| 4.234866897038917 | 2.553 | 2.23 | 2.006 |
| 4.238008489692506 | 2.554 | 2.231 | 2.006 |
| 4.241150082346096 | 2.556 | 2.231 | 2.007 |
| 4.244291674999685 | 2.557 | 2.232 | 2.008 |
| 4.247433267653276 | 2.558 | 2.233 | 2.009 |
| 4.250574860306865 | 2.559 | 2.234 | 2.009 |
| 4.253716452960455 | 2.56 | 2.235 | 2.01 |
| 4.256858045614044 | 2.562 | 2.236 | 2.011 |
| 4.259999638267634 | 2.563 | 2.237 | 2.012 |
| 4.263141230921224 | 2.564 | 2.238 | 2.012 |
| 4.266282823574813 | 2.565 | 2.239 | 2.013 |
| 4.269424416228403 | 2.566 | 2.24 | 2.014 |
| 4.272566008881992 | 2.568 | 2.241 | 2.015 |
| 4.275707601535582 | 2.569 | 2.242 | 2.015 |
| 4.27884919418917 | 2.57 | 2.242 | 2.016 |
| 4.28199078684276 | 2.571 | 2.243 | 2.017 |
| 4.285132379496351 | 2.572 | 2.244 | 2.018 |
| 4.28827397214994 | 2.573 | 2.245 | 2.018 |
| 4.29141556480353 | 2.575 | 2.246 | 2.019 |
| 4.294557157457119 | 2.576 | 2.247 | 2.02 |
| 4.29769875011071 | 2.577 | 2.248 | 2.021 |
| 4.300840342764299 | 2.578 | 2.249 | 2.021 |
| 4.303981935417888 | 2.579 | 2.25 | 2.022 |
| 4.307123528071478 | 2.581 | 2.251 | 2.023 |
| 4.310265120725067 | 2.582 | 2.251 | 2.023 |
| 4.313406713378657 | 2.583 | 2.252 | 2.024 |
| 4.316548306032247 | 2.584 | 2.253 | 2.025 |
| 4.319689898685836 | 2.585 | 2.254 | 2.026 |
| 4.322831491339426 | 2.586 | 2.255 | 2.026 |
| 4.325973083993015 | 2.587 | 2.256 | 2.027 |
| 4.329114676646605 | 2.589 | 2.257 | 2.028 |
| 4.332256269300195 | 2.59 | 2.258 | 2.028 |
| 4.335397861953784 | 2.591 | 2.258 | 2.029 |
| 4.338539454607374 | 2.592 | 2.259 | 2.03 |
| 4.341681047260963 | 2.593 | 2.26 | 2.03 |
| 4.344822639914553 | 2.594 | 2.261 | 2.031 |
| 4.347964232568143 | 2.596 | 2.262 | 2.032 |
| 4.351105825221732 | 2.597 | 2.263 | 2.033 |
| 4.354247417875322 | 2.598 | 2.264 | 2.033 |
| 4.357389010528911 | 2.599 | 2.265 | 2.034 |
| 4.360530603182501 | 2.6 | 2.265 | 2.035 |
| 4.36367219583609 | 2.601 | 2.266 | 2.035 |
| 4.36681378848968 | 2.602 | 2.267 | 2.036 |
| 4.36995538114327 | 2.604 | 2.268 | 2.037 |
| 4.373096973796859 | 2.605 | 2.269 | 2.037 |
| 4.376238566450449 | 2.606 | 2.27 | 2.038 |
| 4.379380159104038 | 2.607 | 2.271 | 2.039 |
| 4.382521751757628 | 2.608 | 2.271 | 2.039 |
| 4.385663344411217 | 2.609 | 2.272 | 2.04 |
| 4.388804937064807 | 2.61 | 2.273 | 2.041 |
| 4.391946529718397 | 2.611 | 2.274 | 2.042 |
| 4.395088122371987 | 2.613 | 2.275 | 2.042 |
| 4.398229715025576 | 2.614 | 2.276 | 2.043 |
| 4.401371307679165 | 2.615 | 2.277 | 2.044 |
| 4.404512900332755 | 2.616 | 2.277 | 2.044 |
| 4.407654492986345 | 2.617 | 2.278 | 2.045 |
| 4.410796085639934 | 2.618 | 2.279 | 2.046 |
| 4.413937678293524 | 2.619 | 2.28 | 2.046 |
| 4.417079270947114 | 2.62 | 2.281 | 2.047 |
| 4.420220863600703 | 2.621 | 2.282 | 2.048 |
| 4.423362456254293 | 2.623 | 2.282 | 2.048 |
| 4.426504048907883 | 2.624 | 2.283 | 2.049 |
| 4.429645641561472 | 2.625 | 2.284 | 2.05 |
| 4.432787234215062 | 2.626 | 2.285 | 2.05 |
| 4.435928826868651 | 2.627 | 2.286 | 2.051 |
| 4.43907041952224 | 2.628 | 2.287 | 2.052 |
| 4.44221201217583 | 2.629 | 2.287 | 2.052 |
| 4.44535360482942 | 2.63 | 2.288 | 2.053 |
| 4.44849519748301 | 2.631 | 2.289 | 2.054 |
| 4.4516367901366 | 2.632 | 2.29 | 2.054 |
| 4.454778382790188 | 2.634 | 2.291 | 2.055 |
| 4.457919975443779 | 2.635 | 2.292 | 2.056 |
| 4.461061568097368 | 2.636 | 2.292 | 2.056 |
| 4.464203160750958 | 2.637 | 2.293 | 2.057 |
| 4.467344753404547 | 2.638 | 2.294 | 2.058 |
| 4.470486346058137 | 2.639 | 2.295 | 2.058 |
| 4.473627938711726 | 2.64 | 2.296 | 2.059 |
| 4.476769531365316 | 2.641 | 2.296 | 2.06 |
| 4.479911124018905 | 2.642 | 2.297 | 2.06 |
| 4.483052716672495 | 2.643 | 2.298 | 2.061 |
| 4.486194309326085 | 2.644 | 2.299 | 2.062 |
| 4.489335901979674 | 2.646 | 2.3 | 2.062 |
| 4.492477494633264 | 2.647 | 2.301 | 2.063 |
| 4.495619087286854 | 2.648 | 2.301 | 2.064 |
| 4.498760679940443 | 2.649 | 2.302 | 2.064 |
| 4.501902272594033 | 2.65 | 2.303 | 2.065 |
| 4.505043865247622 | 2.651 | 2.304 | 2.065 |
| 4.508185457901212 | 2.652 | 2.305 | 2.066 |
| 4.511327050554801 | 2.653 | 2.305 | 2.067 |
| 4.514468643208391 | 2.654 | 2.306 | 2.067 |
| 4.517610235861981 | 2.655 | 2.307 | 2.068 |
| 4.520751828515571 | 2.656 | 2.308 | 2.069 |
| 4.52389342116916 | 2.657 | 2.309 | 2.069 |
| 4.52703501382275 | 2.658 | 2.309 | 2.07 |
| 4.530176606476339 | 2.66 | 2.31 | 2.071 |
| 4.533318199129928 | 2.661 | 2.311 | 2.071 |
| 4.536459791783518 | 2.662 | 2.312 | 2.072 |
| 4.539601384437108 | 2.663 | 2.313 | 2.073 |
| 4.542742977090698 | 2.664 | 2.313 | 2.073 |
| 4.545884569744287 | 2.665 | 2.314 | 2.074 |
| 4.549026162397876 | 2.666 | 2.315 | 2.075 |
| 4.552167755051466 | 2.667 | 2.316 | 2.075 |
| 4.555309347705056 | 2.668 | 2.317 | 2.076 |
| 4.558450940358646 | 2.669 | 2.317 | 2.076 |
| 4.561592533012235 | 2.67 | 2.318 | 2.077 |
| 4.564734125665825 | 2.671 | 2.319 | 2.078 |
| 4.567875718319415 | 2.672 | 2.32 | 2.078 |
| 4.571017310973004 | 2.673 | 2.321 | 2.079 |
| 4.574158903626594 | 2.674 | 2.321 | 2.08 |
| 4.577300496280183 | 2.675 | 2.322 | 2.08 |
| 4.580442088933772 | 2.677 | 2.323 | 2.081 |
| 4.583583681587362 | 2.678 | 2.324 | 2.082 |
| 4.586725274240952 | 2.679 | 2.325 | 2.082 |
| 4.589866866894542 | 2.68 | 2.325 | 2.083 |
| 4.593008459548131 | 2.681 | 2.326 | 2.083 |
| 4.596150052201721 | 2.682 | 2.327 | 2.084 |
| 4.59929164485531 | 2.683 | 2.328 | 2.085 |
| 4.6024332375089 | 2.684 | 2.329 | 2.085 |
| 4.60557483016249 | 2.685 | 2.329 | 2.086 |
| 4.608716422816079 | 2.686 | 2.33 | 2.087 |
| 4.611858015469668 | 2.687 | 2.331 | 2.087 |
| 4.614999608123258 | 2.688 | 2.332 | 2.088 |
| 4.618141200776848 | 2.689 | 2.333 | 2.089 |
| 4.621282793430437 | 2.69 | 2.333 | 2.089 |
| 4.624424386084027 | 2.691 | 2.334 | 2.09 |
| 4.627565978737617 | 2.692 | 2.335 | 2.09 |
| 4.630707571391206 | 2.693 | 2.336 | 2.091 |
| 4.633849164044795 | 2.694 | 2.337 | 2.092 |
| 4.636990756698386 | 2.696 | 2.337 | 2.092 |
| 4.640132349351975 | 2.697 | 2.338 | 2.093 |
| 4.643273942005564 | 2.698 | 2.339 | 2.094 |
| 4.646415534659154 | 2.699 | 2.34 | 2.094 |
| 4.649557127312744 | 2.7 | 2.34 | 2.095 |
| 4.652698719966334 | 2.701 | 2.341 | 2.095 |
| 4.655840312619923 | 2.702 | 2.342 | 2.096 |
| 4.658981905273513 | 2.703 | 2.343 | 2.097 |
| 4.662123497927102 | 2.704 | 2.344 | 2.097 |
| 4.665265090580692 | 2.705 | 2.344 | 2.098 |
| 4.668406683234282 | 2.706 | 2.345 | 2.099 |
| 4.671548275887871 | 2.707 | 2.346 | 2.099 |
| 4.674689868541461 | 2.708 | 2.347 | 2.1 |
| 4.67783146119505 | 2.709 | 2.348 | 2.101 |
| 4.68097305384864 | 2.71 | 2.348 | 2.101 |
| 4.68411464650223 | 2.711 | 2.349 | 2.102 |
| 4.687256239155819 | 2.712 | 2.35 | 2.102 |
| 4.690397831809409 | 2.713 | 2.351 | 2.103 |
| 4.693539424462998 | 2.714 | 2.351 | 2.104 |
| 4.696681017116588 | 2.715 | 2.352 | 2.104 |
| 4.699822609770177 | 2.717 | 2.353 | 2.105 |
| 4.702964202423767 | 2.718 | 2.354 | 2.106 |
| 4.706105795077356 | 2.719 | 2.355 | 2.106 |
| 4.709247387730946 | 2.72 | 2.355 | 2.107 |
| 4.712388980384535 | 2.721 | 2.356 | 2.107 |
| 4.715530573038126 | 2.722 | 2.357 | 2.108 |
| 4.718672165691715 | 2.723 | 2.358 | 2.109 |
| 4.721813758345305 | 2.724 | 2.359 | 2.109 |
| 4.724955350998894 | 2.725 | 2.359 | 2.11 |
| 4.728096943652484 | 2.726 | 2.36 | 2.111 |
| 4.731238536306074 | 2.727 | 2.361 | 2.111 |
| 4.734380128959663 | 2.728 | 2.362 | 2.112 |
| 4.737521721613253 | 2.729 | 2.362 | 2.112 |
| 4.740663314266842 | 2.73 | 2.363 | 2.113 |
| 4.743804906920432 | 2.731 | 2.364 | 2.114 |
| 4.74694649957402 | 2.732 | 2.365 | 2.114 |
| 4.750088092227611 | 2.733 | 2.366 | 2.115 |
| 4.7532296848812 | 2.734 | 2.366 | 2.116 |
| 4.75637127753479 | 2.735 | 2.367 | 2.116 |
| 4.75951287018838 | 2.736 | 2.368 | 2.117 |
| 4.76265446284197 | 2.737 | 2.369 | 2.118 |
| 4.765796055495559 | 2.739 | 2.37 | 2.118 |
| 4.768937648149149 | 2.74 | 2.37 | 2.119 |
| 4.772079240802738 | 2.741 | 2.371 | 2.119 |
| 4.775220833456327 | 2.742 | 2.372 | 2.12 |
| 4.778362426109917 | 2.743 | 2.373 | 2.121 |
| 4.781504018763507 | 2.744 | 2.373 | 2.121 |
| 4.784645611417097 | 2.745 | 2.374 | 2.122 |
| 4.787787204070686 | 2.746 | 2.375 | 2.123 |
| 4.790928796724275 | 2.747 | 2.376 | 2.123 |
| 4.794070389377865 | 2.748 | 2.377 | 2.124 |
| 4.797211982031455 | 2.749 | 2.377 | 2.124 |
| 4.800353574685045 | 2.75 | 2.378 | 2.125 |
| 4.803495167338634 | 2.751 | 2.379 | 2.126 |
| 4.806636759992224 | 2.752 | 2.38 | 2.126 |
| 4.809778352645814 | 2.753 | 2.381 | 2.127 |
| 4.812919945299403 | 2.754 | 2.381 | 2.128 |
| 4.816061537952993 | 2.755 | 2.382 | 2.128 |
| 4.819203130606582 | 2.756 | 2.383 | 2.129 |
| 4.822344723260172 | 2.757 | 2.384 | 2.13 |
| 4.825486315913761 | 2.759 | 2.385 | 2.13 |
| 4.828627908567351 | 2.76 | 2.385 | 2.131 |
| 4.83176950122094 | 2.761 | 2.386 | 2.131 |
| 4.83491109387453 | 2.762 | 2.387 | 2.132 |
| 4.83805268652812 | 2.763 | 2.388 | 2.133 |
| 4.841194279181709 | 2.764 | 2.389 | 2.133 |
| 4.844335871835299 | 2.765 | 2.389 | 2.134 |
| 4.847477464488889 | 2.766 | 2.39 | 2.135 |
| 4.850619057142478 | 2.767 | 2.391 | 2.135 |
| 4.853760649796068 | 2.768 | 2.392 | 2.136 |
| 4.856902242449657 | 2.769 | 2.393 | 2.137 |
| 4.860043835103247 | 2.77 | 2.393 | 2.137 |
| 4.863185427756837 | 2.771 | 2.394 | 2.138 |
| 4.866327020410426 | 2.772 | 2.395 | 2.138 |
| 4.869468613064015 | 2.773 | 2.396 | 2.139 |
| 4.872610205717605 | 2.774 | 2.397 | 2.14 |
| 4.875751798371195 | 2.775 | 2.397 | 2.14 |
| 4.878893391024784 | 2.777 | 2.398 | 2.141 |
| 4.882034983678374 | 2.778 | 2.399 | 2.142 |
| 4.885176576331964 | 2.779 | 2.4 | 2.142 |
| 4.888318168985553 | 2.78 | 2.401 | 2.143 |
| 4.891459761639143 | 2.781 | 2.401 | 2.144 |
| 4.894601354292733 | 2.782 | 2.402 | 2.144 |
| 4.897742946946322 | 2.783 | 2.403 | 2.145 |
| 4.900884539599912 | 2.784 | 2.404 | 2.146 |
| 4.904026132253501 | 2.785 | 2.405 | 2.146 |
| 4.907167724907091 | 2.786 | 2.405 | 2.147 |
| 4.91030931756068 | 2.787 | 2.406 | 2.147 |
| 4.91345091021427 | 2.788 | 2.407 | 2.148 |
| 4.91659250286786 | 2.789 | 2.408 | 2.149 |
| 4.91973409552145 | 2.79 | 2.409 | 2.149 |
| 4.922875688175039 | 2.792 | 2.409 | 2.15 |
| 4.926017280828628 | 2.793 | 2.41 | 2.151 |
| 4.929158873482218 | 2.794 | 2.411 | 2.151 |
| 4.932300466135808 | 2.795 | 2.412 | 2.152 |
| 4.935442058789397 | 2.796 | 2.413 | 2.153 |
| 4.938583651442987 | 2.797 | 2.413 | 2.153 |
| 4.941725244096576 | 2.798 | 2.414 | 2.154 |
| 4.944866836750166 | 2.799 | 2.415 | 2.155 |
| 4.948008429403755 | 2.8 | 2.416 | 2.155 |
| 4.951150022057345 | 2.801 | 2.417 | 2.156 |
| 4.954291614710935 | 2.802 | 2.418 | 2.157 |
| 4.957433207364524 | 2.803 | 2.418 | 2.157 |
| 4.960574800018114 | 2.805 | 2.419 | 2.158 |
| 4.963716392671704 | 2.806 | 2.42 | 2.159 |
| 4.966857985325293 | 2.807 | 2.421 | 2.159 |
| 4.969999577978883 | 2.808 | 2.422 | 2.16 |
| 4.973141170632472 | 2.809 | 2.423 | 2.161 |
| 4.976282763286062 | 2.81 | 2.423 | 2.161 |
| 4.979424355939651 | 2.811 | 2.424 | 2.162 |
| 4.982565948593241 | 2.812 | 2.425 | 2.163 |
| 4.985707541246831 | 2.813 | 2.426 | 2.163 |
| 4.98884913390042 | 2.814 | 2.427 | 2.164 |
| 4.99199072655401 | 2.816 | 2.427 | 2.165 |
| 4.9951323192076 | 2.817 | 2.428 | 2.165 |
| 4.99827391186119 | 2.818 | 2.429 | 2.166 |
| 5.00141550451478 | 2.819 | 2.43 | 2.167 |
| 5.004557097168369 | 2.82 | 2.431 | 2.167 |
| 5.007698689821958 | 2.821 | 2.432 | 2.168 |
| 5.010840282475548 | 2.822 | 2.433 | 2.169 |
| 5.013981875129137 | 2.823 | 2.433 | 2.169 |
| 5.017123467782727 | 2.824 | 2.434 | 2.17 |
| 5.020265060436317 | 2.826 | 2.435 | 2.171 |
| 5.023406653089906 | 2.827 | 2.436 | 2.171 |
| 5.026548245743496 | 2.828 | 2.437 | 2.172 |
| 5.029689838397085 | 2.829 | 2.438 | 2.173 |
| 5.032831431050674 | 2.83 | 2.438 | 2.173 |
| 5.035973023704264 | 2.831 | 2.439 | 2.174 |
| 5.039114616357854 | 2.832 | 2.44 | 2.175 |
| 5.042256209011444 | 2.833 | 2.441 | 2.175 |
| 5.045397801665033 | 2.834 | 2.442 | 2.176 |
| 5.048539394318622 | 2.836 | 2.443 | 2.177 |
| 5.051680986972213 | 2.837 | 2.444 | 2.177 |
| 5.054822579625802 | 2.838 | 2.444 | 2.178 |
| 5.057964172279392 | 2.839 | 2.445 | 2.179 |
| 5.061105764932981 | 2.84 | 2.446 | 2.18 |
| 5.064247357586571 | 2.841 | 2.447 | 2.18 |
| 5.067388950240161 | 2.842 | 2.448 | 2.181 |
| 5.07053054289375 | 2.844 | 2.449 | 2.182 |
| 5.07367213554734 | 2.845 | 2.45 | 2.182 |
| 5.07681372820093 | 2.846 | 2.45 | 2.183 |
| 5.079955320854519 | 2.847 | 2.451 | 2.184 |
| 5.083096913508108 | 2.848 | 2.452 | 2.184 |
| 5.086238506161698 | 2.849 | 2.453 | 2.185 |
| 5.089380098815288 | 2.85 | 2.454 | 2.186 |
| 5.092521691468877 | 2.852 | 2.455 | 2.187 |
| 5.095663284122466 | 2.853 | 2.456 | 2.187 |
| 5.098804876776057 | 2.854 | 2.457 | 2.188 |
| 5.101946469429646 | 2.855 | 2.457 | 2.189 |
| 5.105088062083236 | 2.856 | 2.458 | 2.189 |
| 5.108229654736825 | 2.857 | 2.459 | 2.19 |
| 5.111371247390415 | 2.859 | 2.46 | 2.191 |
| 5.114512840044005 | 2.86 | 2.461 | 2.192 |
| 5.117654432697594 | 2.861 | 2.462 | 2.192 |
| 5.120796025351184 | 2.862 | 2.463 | 2.193 |
| 5.123937618004773 | 2.863 | 2.464 | 2.194 |
| 5.127079210658363 | 2.864 | 2.465 | 2.194 |
| 5.130220803311953 | 2.866 | 2.465 | 2.195 |
| 5.133362395965542 | 2.867 | 2.466 | 2.196 |
| 5.136503988619131 | 2.868 | 2.467 | 2.197 |
| 5.13964558127272 | 2.869 | 2.468 | 2.197 |
| 5.142787173926311 | 2.87 | 2.469 | 2.198 |
| 5.1459287665799 | 2.871 | 2.47 | 2.199 |
| 5.14907035923349 | 2.873 | 2.471 | 2.199 |
| 5.15221195188708 | 2.874 | 2.472 | 2.2 |
| 5.15535354454067 | 2.875 | 2.473 | 2.201 |
| 5.158495137194259 | 2.876 | 2.474 | 2.202 |
| 5.161636729847848 | 2.877 | 2.474 | 2.202 |
| 5.164778322501438 | 2.879 | 2.475 | 2.203 |
| 5.167919915155028 | 2.88 | 2.476 | 2.204 |
| 5.171061507808617 | 2.881 | 2.477 | 2.205 |
| 5.174203100462206 | 2.882 | 2.478 | 2.205 |
| 5.177344693115796 | 2.883 | 2.479 | 2.206 |
| 5.180486285769386 | 2.885 | 2.48 | 2.207 |
| 5.183627878422976 | 2.886 | 2.481 | 2.208 |
| 5.186769471076565 | 2.887 | 2.482 | 2.208 |
| 5.189911063730155 | 2.888 | 2.483 | 2.209 |
| 5.193052656383744 | 2.89 | 2.484 | 2.21 |
| 5.196194249037334 | 2.891 | 2.485 | 2.211 |
| 5.199335841690924 | 2.892 | 2.486 | 2.211 |
| 5.202477434344513 | 2.893 | 2.487 | 2.212 |
| 5.205619026998103 | 2.894 | 2.487 | 2.213 |
| 5.208760619651692 | 2.896 | 2.488 | 2.214 |
| 5.211902212305282 | 2.897 | 2.489 | 2.214 |
| 5.215043804958871 | 2.898 | 2.49 | 2.215 |
| 5.218185397612461 | 2.899 | 2.491 | 2.216 |
| 5.221326990266051 | 2.901 | 2.492 | 2.217 |
| 5.22446858291964 | 2.902 | 2.493 | 2.218 |
| 5.22761017557323 | 2.903 | 2.494 | 2.218 |
| 5.23075176822682 | 2.904 | 2.495 | 2.219 |
| 5.23389336088041 | 2.906 | 2.496 | 2.22 |
| 5.237034953533999 | 2.907 | 2.497 | 2.221 |
| 5.240176546187588 | 2.908 | 2.498 | 2.221 |
| 5.243318138841178 | 2.909 | 2.499 | 2.222 |
| 5.246459731494767 | 2.911 | 2.5 | 2.223 |
| 5.249601324148357 | 2.912 | 2.501 | 2.224 |
| 5.252742916801947 | 2.913 | 2.502 | 2.225 |
| 5.255884509455536 | 2.914 | 2.503 | 2.225 |
| 5.259026102109125 | 2.916 | 2.504 | 2.226 |
| 5.262167694762715 | 2.917 | 2.505 | 2.227 |
| 5.265309287416305 | 2.918 | 2.506 | 2.228 |
| 5.268450880069895 | 2.92 | 2.507 | 2.229 |
| 5.271592472723484 | 2.921 | 2.508 | 2.229 |
| 5.274734065377074 | 2.922 | 2.509 | 2.23 |
| 5.277875658030664 | 2.923 | 2.51 | 2.231 |
| 5.281017250684253 | 2.925 | 2.511 | 2.232 |
| 5.284158843337843 | 2.926 | 2.512 | 2.233 |
| 5.287300435991432 | 2.927 | 2.513 | 2.234 |
| 5.290442028645022 | 2.929 | 2.514 | 2.234 |
| 5.293583621298612 | 2.93 | 2.515 | 2.235 |
| 5.296725213952201 | 2.931 | 2.516 | 2.236 |
| 5.299866806605791 | 2.933 | 2.517 | 2.237 |
| 5.30300839925938 | 2.934 | 2.518 | 2.238 |
| 5.30614999191297 | 2.935 | 2.519 | 2.239 |
| 5.30929158456656 | 2.937 | 2.52 | 2.239 |
| 5.312433177220149 | 2.938 | 2.521 | 2.24 |
| 5.315574769873739 | 2.939 | 2.522 | 2.241 |
| 5.318716362527328 | 2.941 | 2.523 | 2.242 |
| 5.321857955180918 | 2.942 | 2.524 | 2.243 |
| 5.324999547834508 | 2.943 | 2.525 | 2.244 |
| 5.328141140488097 | 2.945 | 2.526 | 2.244 |
| 5.331282733141686 | 2.946 | 2.527 | 2.245 |
| 5.334424325795276 | 2.947 | 2.528 | 2.246 |
| 5.337565918448866 | 2.949 | 2.529 | 2.247 |
| 5.340707511102456 | 2.95 | 2.53 | 2.248 |
| 5.343849103756045 | 2.951 | 2.531 | 2.249 |
| 5.346990696409634 | 2.953 | 2.533 | 2.25 |
| 5.350132289063224 | 2.954 | 2.534 | 2.251 |
| 5.353273881716814 | 2.955 | 2.535 | 2.251 |
| 5.356415474370403 | 2.957 | 2.536 | 2.252 |
| 5.359557067023993 | 2.958 | 2.537 | 2.253 |
| 5.362698659677583 | 2.96 | 2.538 | 2.254 |
| 5.365840252331172 | 2.961 | 2.539 | 2.255 |
| 5.368981844984762 | 2.962 | 2.54 | 2.256 |
| 5.372123437638351 | 2.964 | 2.541 | 2.257 |
| 5.375265030291941 | 2.965 | 2.542 | 2.258 |
| 5.378406622945531 | 2.967 | 2.543 | 2.259 |
| 5.38154821559912 | 2.968 | 2.544 | 2.259 |
| 5.38468980825271 | 2.969 | 2.546 | 2.26 |
| 5.387831400906299 | 2.971 | 2.547 | 2.261 |
| 5.39097299355989 | 2.972 | 2.548 | 2.262 |
| 5.394114586213479 | 2.974 | 2.549 | 2.263 |
| 5.397256178867068 | 2.975 | 2.55 | 2.264 |
| 5.400397771520657 | 2.977 | 2.551 | 2.265 |
| 5.403539364174247 | 2.978 | 2.552 | 2.266 |
| 5.406680956827837 | 2.979 | 2.553 | 2.267 |
| 5.409822549481426 | 2.981 | 2.555 | 2.268 |
| 5.412964142135016 | 2.982 | 2.556 | 2.269 |
| 5.416105734788605 | 2.984 | 2.557 | 2.27 |
| 5.419247327442195 | 2.985 | 2.558 | 2.271 |
| 5.422388920095785 | 2.987 | 2.559 | 2.272 |
| 5.425530512749375 | 2.988 | 2.56 | 2.273 |
| 5.428672105402964 | 2.99 | 2.561 | 2.273 |
| 5.431813698056554 | 2.991 | 2.563 | 2.274 |
| 5.434955290710143 | 2.993 | 2.564 | 2.275 |
| 5.438096883363733 | 2.994 | 2.565 | 2.276 |
| 5.441238476017322 | 2.995 | 2.566 | 2.277 |
| 5.444380068670912 | 2.997 | 2.567 | 2.278 |
| 5.447521661324502 | 2.998 | 2.568 | 2.279 |
| 5.450663253978091 | 3 | 2.57 | 2.28 |
| 5.453804846631681 | 3.001 | 2.571 | 2.281 |
| 5.456946439285271 | 3.003 | 2.572 | 2.282 |
| 5.46008803193886 | 3.004 | 2.573 | 2.283 |
| 5.46322962459245 | 3.006 | 2.574 | 2.284 |
| 5.466371217246039 | 3.008 | 2.576 | 2.285 |
| 5.46951280989963 | 3.009 | 2.577 | 2.286 |
| 5.472654402553218 | 3.011 | 2.578 | 2.287 |
| 5.475795995206808 | 3.012 | 2.579 | 2.288 |
| 5.478937587860398 | 3.014 | 2.581 | 2.289 |
| 5.482079180513987 | 3.015 | 2.582 | 2.29 |
| 5.485220773167577 | 3.017 | 2.583 | 2.291 |
| 5.488362365821166 | 3.018 | 2.584 | 2.292 |
| 5.491503958474756 | 3.02 | 2.586 | 2.293 |
| 5.494645551128346 | 3.021 | 2.587 | 2.294 |
| 5.497787143781935 | 3.023 | 2.588 | 2.296 |
| 5.500928736435525 | 3.025 | 2.589 | 2.297 |
| 5.504070329089115 | 3.026 | 2.591 | 2.298 |
| 5.507211921742704 | 3.028 | 2.592 | 2.299 |
| 5.510353514396294 | 3.029 | 2.593 | 2.3 |
| 5.513495107049883 | 3.031 | 2.594 | 2.301 |
| 5.516636699703473 | 3.033 | 2.596 | 2.302 |
| 5.519778292357062 | 3.034 | 2.597 | 2.303 |
| 5.522919885010652 | 3.036 | 2.598 | 2.304 |
| 5.526061477664242 | 3.037 | 2.6 | 2.305 |
| 5.529203070317831 | 3.039 | 2.601 | 2.306 |
| 5.532344662971421 | 3.041 | 2.602 | 2.307 |
| 5.535486255625011 | 3.042 | 2.603 | 2.308 |
| 5.5386278482786 | 3.044 | 2.605 | 2.31 |
| 5.54176944093219 | 3.045 | 2.606 | 2.311 |
| 5.544911033585779 | 3.047 | 2.607 | 2.312 |
| 5.54805262623937 | 3.049 | 2.609 | 2.313 |
| 5.551194218892959 | 3.05 | 2.61 | 2.314 |
| 5.554335811546548 | 3.052 | 2.611 | 2.315 |
| 5.557477404200137 | 3.054 | 2.613 | 2.316 |
| 5.560618996853727 | 3.055 | 2.614 | 2.317 |
| 5.563760589507317 | 3.057 | 2.616 | 2.319 |
| 5.566902182160906 | 3.059 | 2.617 | 2.32 |
| 5.570043774814496 | 3.06 | 2.618 | 2.321 |
| 5.573185367468086 | 3.062 | 2.62 | 2.322 |
| 5.576326960121675 | 3.064 | 2.621 | 2.323 |
| 5.579468552775264 | 3.066 | 2.622 | 2.324 |
| 5.582610145428854 | 3.067 | 2.624 | 2.326 |
| 5.585751738082444 | 3.069 | 2.625 | 2.327 |
| 5.588893330736034 | 3.071 | 2.627 | 2.328 |
| 5.592034923389623 | 3.072 | 2.628 | 2.329 |
| 5.595176516043213 | 3.074 | 2.629 | 2.33 |
| 5.598318108696803 | 3.076 | 2.631 | 2.331 |
| 5.601459701350392 | 3.078 | 2.632 | 2.333 |
| 5.604601294003982 | 3.079 | 2.634 | 2.334 |
| 5.607742886657571 | 3.081 | 2.635 | 2.335 |
| 5.610884479311161 | 3.083 | 2.637 | 2.336 |
| 5.61402607196475 | 3.085 | 2.638 | 2.338 |
| 5.61716766461834 | 3.087 | 2.64 | 2.339 |
| 5.62030925727193 | 3.088 | 2.641 | 2.34 |
| 5.623450849925519 | 3.09 | 2.642 | 2.341 |
| 5.626592442579109 | 3.092 | 2.644 | 2.343 |
| 5.629734035232698 | 3.094 | 2.645 | 2.344 |
| 5.632875627886288 | 3.096 | 2.647 | 2.345 |
| 5.636017220539878 | 3.097 | 2.648 | 2.346 |
| 5.639158813193467 | 3.099 | 2.65 | 2.348 |
| 5.642300405847057 | 3.101 | 2.651 | 2.349 |
| 5.645441998500646 | 3.103 | 2.653 | 2.35 |
| 5.648583591154236 | 3.105 | 2.655 | 2.352 |
| 5.651725183807825 | 3.107 | 2.656 | 2.353 |
| 5.654866776461415 | 3.108 | 2.658 | 2.354 |
| 5.658008369115005 | 3.11 | 2.659 | 2.356 |
| 5.661149961768594 | 3.112 | 2.661 | 2.357 |
| 5.664291554422184 | 3.114 | 2.662 | 2.358 |
| 5.667433147075774 | 3.116 | 2.664 | 2.36 |
| 5.670574739729363 | 3.118 | 2.665 | 2.361 |
| 5.673716332382953 | 3.12 | 2.667 | 2.362 |
| 5.676857925036542 | 3.122 | 2.669 | 2.364 |
| 5.679999517690132 | 3.123 | 2.67 | 2.365 |
| 5.683141110343721 | 3.125 | 2.672 | 2.366 |
| 5.686282702997311 | 3.127 | 2.673 | 2.368 |
| 5.689424295650901 | 3.129 | 2.675 | 2.369 |
| 5.69256588830449 | 3.131 | 2.677 | 2.371 |
| 5.69570748095808 | 3.133 | 2.678 | 2.372 |
| 5.69884907361167 | 3.135 | 2.68 | 2.373 |
| 5.701990666265259 | 3.137 | 2.682 | 2.375 |
| 5.705132258918849 | 3.139 | 2.683 | 2.376 |
| 5.708273851572438 | 3.141 | 2.685 | 2.378 |
| 5.711415444226028 | 3.143 | 2.686 | 2.379 |
| 5.714557036879618 | 3.145 | 2.688 | 2.381 |
| 5.717698629533207 | 3.147 | 2.69 | 2.382 |
| 5.720840222186797 | 3.149 | 2.692 | 2.383 |
| 5.723981814840386 | 3.151 | 2.693 | 2.385 |
| 5.727123407493976 | 3.153 | 2.695 | 2.386 |
| 5.730265000147565 | 3.155 | 2.697 | 2.388 |
| 5.733406592801155 | 3.157 | 2.698 | 2.389 |
| 5.736548185454744 | 3.159 | 2.7 | 2.391 |
| 5.739689778108334 | 3.161 | 2.702 | 2.392 |
| 5.742831370761924 | 3.163 | 2.704 | 2.394 |
| 5.745972963415514 | 3.165 | 2.705 | 2.395 |
| 5.749114556069103 | 3.167 | 2.707 | 2.397 |
| 5.752256148722693 | 3.169 | 2.709 | 2.399 |
| 5.755397741376282 | 3.171 | 2.711 | 2.4 |
| 5.758539334029872 | 3.173 | 2.712 | 2.402 |
| 5.761680926683462 | 3.176 | 2.714 | 2.403 |
| 5.764822519337051 | 3.178 | 2.716 | 2.405 |
| 5.767964111990641 | 3.18 | 2.718 | 2.406 |
| 5.77110570464423 | 3.182 | 2.72 | 2.408 |
| 5.77424729729782 | 3.184 | 2.722 | 2.41 |
| 5.77738888995141 | 3.186 | 2.723 | 2.411 |
| 5.780530482605 | 3.188 | 2.725 | 2.413 |
| 5.783672075258588 | 3.19 | 2.727 | 2.414 |
| 5.786813667912178 | 3.193 | 2.729 | 2.416 |
| 5.789955260565768 | 3.195 | 2.731 | 2.418 |
| 5.793096853219358 | 3.197 | 2.733 | 2.419 |
| 5.796238445872947 | 3.199 | 2.735 | 2.421 |
| 5.799380038526537 | 3.201 | 2.736 | 2.423 |
| 5.802521631180126 | 3.203 | 2.738 | 2.424 |
| 5.805663223833715 | 3.206 | 2.74 | 2.426 |
| 5.808804816487306 | 3.208 | 2.742 | 2.428 |
| 5.811946409140895 | 3.21 | 2.744 | 2.43 |
| 5.815088001794485 | 3.212 | 2.746 | 2.431 |
| 5.818229594448074 | 3.215 | 2.748 | 2.433 |
| 5.821371187101663 | 3.217 | 2.75 | 2.435 |
| 5.824512779755254 | 3.219 | 2.752 | 2.437 |
| 5.827654372408843 | 3.221 | 2.754 | 2.438 |
| 5.830795965062433 | 3.224 | 2.756 | 2.44 |
| 5.833937557716022 | 3.226 | 2.758 | 2.442 |
| 5.837079150369612 | 3.228 | 2.76 | 2.444 |
| 5.840220743023201 | 3.23 | 2.762 | 2.445 |
| 5.843362335676791 | 3.233 | 2.764 | 2.447 |
| 5.846503928330381 | 3.235 | 2.766 | 2.449 |
| 5.84964552098397 | 3.237 | 2.768 | 2.451 |
| 5.85278711363756 | 3.24 | 2.77 | 2.453 |
| 5.85592870629115 | 3.242 | 2.772 | 2.455 |
| 5.85907029894474 | 3.244 | 2.774 | 2.457 |
| 5.862211891598329 | 3.247 | 2.776 | 2.458 |
| 5.865353484251918 | 3.249 | 2.779 | 2.46 |
| 5.868495076905508 | 3.251 | 2.781 | 2.462 |
| 5.871636669559098 | 3.254 | 2.783 | 2.464 |
| 5.874778262212687 | 3.256 | 2.785 | 2.466 |
| 5.877919854866277 | 3.259 | 2.787 | 2.468 |
| 5.881061447519866 | 3.261 | 2.789 | 2.47 |
| 5.884203040173456 | 3.263 | 2.791 | 2.472 |
| 5.887344632827046 | 3.266 | 2.793 | 2.474 |
| 5.890486225480635 | 3.268 | 2.796 | 2.476 |
| 5.893627818134224 | 3.271 | 2.798 | 2.478 |
| 5.896769410787814 | 3.273 | 2.8 | 2.48 |
| 5.899911003441404 | 3.276 | 2.802 | 2.482 |
| 5.903052596094994 | 3.278 | 2.804 | 2.484 |
| 5.906194188748583 | 3.281 | 2.807 | 2.486 |
| 5.909335781402172 | 3.283 | 2.809 | 2.488 |
| 5.912477374055762 | 3.286 | 2.811 | 2.49 |
| 5.915618966709352 | 3.288 | 2.813 | 2.492 |
| 5.918760559362942 | 3.291 | 2.816 | 2.494 |
| 5.921902152016531 | 3.293 | 2.818 | 2.496 |
| 5.92504374467012 | 3.296 | 2.82 | 2.498 |
| 5.92818533732371 | 3.298 | 2.823 | 2.5 |
| 5.9313269299773 | 3.301 | 2.825 | 2.503 |
| 5.93446852263089 | 3.303 | 2.827 | 2.505 |
| 5.93761011528448 | 3.306 | 2.83 | 2.507 |
| 5.940751707938068 | 3.308 | 2.832 | 2.509 |
| 5.943893300591658 | 3.311 | 2.834 | 2.511 |
| 5.947034893245248 | 3.313 | 2.837 | 2.513 |
| 5.950176485898837 | 3.316 | 2.839 | 2.516 |
| 5.953318078552427 | 3.319 | 2.841 | 2.518 |
| 5.956459671206017 | 3.321 | 2.844 | 2.52 |
| 5.959601263859606 | 3.324 | 2.846 | 2.522 |
| 5.962742856513196 | 3.326 | 2.849 | 2.524 |
| 5.965884449166785 | 3.329 | 2.851 | 2.527 |
| 5.969026041820375 | 3.332 | 2.853 | 2.529 |
| 5.972167634473964 | 3.334 | 2.856 | 2.531 |
| 5.975309227127554 | 3.337 | 2.858 | 2.534 |
| 5.978450819781144 | 3.34 | 2.861 | 2.536 |
| 5.981592412434733 | 3.342 | 2.863 | 2.538 |
| 5.984734005088323 | 3.345 | 2.866 | 2.54 |
| 5.987875597741913 | 3.348 | 2.868 | 2.543 |
| 5.991017190395502 | 3.35 | 2.871 | 2.545 |
| 5.994158783049092 | 3.353 | 2.873 | 2.548 |
| 5.997300375702681 | 3.356 | 2.876 | 2.55 |
| 6.000441968356271 | 3.358 | 2.878 | 2.552 |
| 6.003583561009861 | 3.361 | 2.881 | 2.555 |
| 6.00672515366345 | 3.364 | 2.884 | 2.557 |
| 6.00986674631704 | 3.367 | 2.886 | 2.56 |
| 6.01300833897063 | 3.369 | 2.889 | 2.562 |
| 6.01614993162422 | 3.372 | 2.891 | 2.564 |
| 6.019291524277808 | 3.375 | 2.894 | 2.567 |
| 6.022433116931398 | 3.378 | 2.896 | 2.569 |
| 6.025574709584988 | 3.38 | 2.899 | 2.572 |
| 6.028716302238577 | 3.383 | 2.902 | 2.574 |
| 6.031857894892167 | 3.386 | 2.904 | 2.577 |
| 6.034999487545757 | 3.389 | 2.907 | 2.579 |
| 6.038141080199346 | 3.392 | 2.91 | 2.582 |
| 6.041282672852935 | 3.394 | 2.912 | 2.584 |
| 6.044424265506525 | 3.397 | 2.915 | 2.587 |
| 6.047565858160115 | 3.4 | 2.918 | 2.59 |
| 6.050707450813704 | 3.403 | 2.92 | 2.592 |
| 6.053849043467294 | 3.406 | 2.923 | 2.595 |
| 6.056990636120884 | 3.409 | 2.926 | 2.597 |
| 6.060132228774473 | 3.411 | 2.929 | 2.6 |
| 6.063273821428063 | 3.414 | 2.931 | 2.603 |
| 6.066415414081653 | 3.417 | 2.934 | 2.605 |
| 6.069557006735242 | 3.42 | 2.937 | 2.608 |
| 6.072698599388831 | 3.423 | 2.94 | 2.611 |
| 6.07584019204242 | 3.426 | 2.942 | 2.613 |
| 6.078981784696011 | 3.429 | 2.945 | 2.616 |
| 6.082123377349601 | 3.432 | 2.948 | 2.619 |
| 6.08526497000319 | 3.435 | 2.951 | 2.621 |
| 6.08840656265678 | 3.438 | 2.954 | 2.624 |
| 6.09154815531037 | 3.44 | 2.957 | 2.627 |
| 6.094689747963959 | 3.443 | 2.959 | 2.63 |
| 6.097831340617549 | 3.446 | 2.962 | 2.632 |
| 6.100972933271138 | 3.449 | 2.965 | 2.635 |
| 6.104114525924728 | 3.452 | 2.968 | 2.638 |
| 6.107256118578317 | 3.455 | 2.971 | 2.641 |
| 6.110397711231907 | 3.458 | 2.974 | 2.644 |
| 6.113539303885497 | 3.461 | 2.977 | 2.646 |
| 6.116680896539086 | 3.464 | 2.979 | 2.649 |
| 6.119822489192675 | 3.467 | 2.982 | 2.652 |
| 6.122964081846265 | 3.47 | 2.985 | 2.655 |
| 6.126105674499855 | 3.473 | 2.988 | 2.658 |
| 6.129247267153445 | 3.476 | 2.991 | 2.661 |
| 6.132388859807034 | 3.479 | 2.994 | 2.663 |
| 6.135530452460624 | 3.482 | 2.997 | 2.666 |
| 6.138672045114213 | 3.485 | 3 | 2.669 |
| 6.141813637767803 | 3.488 | 3.003 | 2.672 |
| 6.144955230421393 | 3.491 | 3.006 | 2.675 |
| 6.148096823074982 | 3.494 | 3.009 | 2.678 |
| 6.151238415728571 | 3.497 | 3.012 | 2.681 |
| 6.154380008382161 | 3.5 | 3.015 | 2.684 |
| 6.157521601035751 | 3.503 | 3.018 | 2.687 |
| 6.16066319368934 | 3.506 | 3.021 | 2.69 |
| 6.16380478634293 | 3.509 | 3.024 | 2.693 |
| 6.16694637899652 | 3.512 | 3.027 | 2.696 |
| 6.170087971650109 | 3.515 | 3.03 | 2.699 |
| 6.173229564303698 | 3.519 | 3.033 | 2.702 |
| 6.176371156957289 | 3.522 | 3.036 | 2.705 |
| 6.179512749610878 | 3.525 | 3.039 | 2.708 |
| 6.182654342264468 | 3.528 | 3.042 | 2.711 |
| 6.185795934918057 | 3.531 | 3.045 | 2.714 |
| 6.188937527571647 | 3.534 | 3.048 | 2.717 |
| 6.192079120225237 | 3.537 | 3.051 | 2.72 |
| 6.195220712878826 | 3.54 | 3.054 | 2.723 |
| 6.198362305532415 | 3.543 | 3.057 | 2.726 |
| 6.201503898186005 | 3.546 | 3.06 | 2.729 |
| 6.204645490839594 | 3.549 | 3.064 | 2.732 |
| 6.207787083493184 | 3.552 | 3.067 | 2.735 |
| 6.210928676146774 | 3.556 | 3.07 | 2.738 |
| 6.214070268800364 | 3.559 | 3.073 | 2.741 |
| 6.217211861453953 | 3.562 | 3.076 | 2.744 |
| 6.220353454107543 | 3.565 | 3.079 | 2.747 |
| 6.223495046761133 | 3.568 | 3.082 | 2.751 |
| 6.226636639414722 | 3.571 | 3.085 | 2.754 |
| 6.229778232068312 | 3.574 | 3.088 | 2.757 |
| 6.232919824721901 | 3.577 | 3.091 | 2.76 |
| 6.236061417375491 | 3.581 | 3.095 | 2.763 |
| 6.23920301002908 | 3.584 | 3.098 | 2.766 |
| 6.24234460268267 | 3.587 | 3.101 | 2.769 |
| 6.24548619533626 | 3.59 | 3.104 | 2.772 |
| 6.24862778798985 | 3.593 | 3.107 | 2.775 |
| 6.251769380643438 | 3.596 | 3.11 | 2.779 |
| 6.254910973297028 | 3.599 | 3.113 | 2.782 |
| 6.258052565950618 | 3.602 | 3.116 | 2.785 |
| 6.261194158604208 | 3.606 | 3.12 | 2.788 |
| 6.264335751257797 | 3.609 | 3.123 | 2.791 |
| 6.267477343911387 | 3.612 | 3.126 | 2.794 |
| 6.270618936564976 | 3.615 | 3.129 | 2.797 |
| 6.273760529218566 | 3.618 | 3.132 | 2.801 |
| 6.276902121872155 | 3.621 | 3.135 | 2.804 |
| 6.280043714525745 | 3.624 | 3.138 | 2.807 |
| 6.283185307179335 | 3.628 | 3.142 | 2.81 |